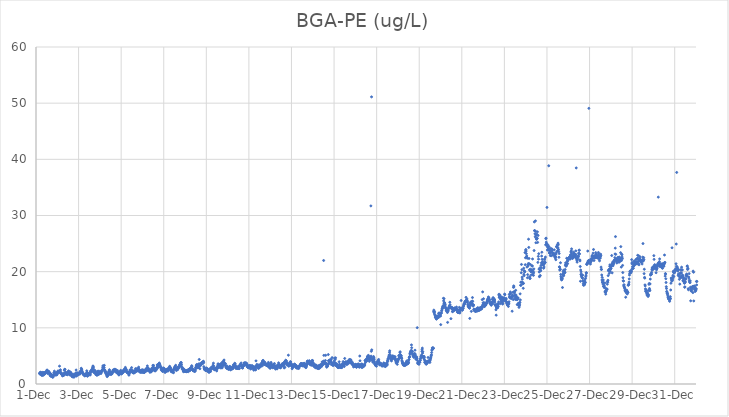
| Category | BGA-PE (ug/L) |
|---|---|
| 44896.166666666664 | 1.91 |
| 44896.177083333336 | 1.79 |
| 44896.1875 | 1.92 |
| 44896.197916666664 | 2.06 |
| 44896.208333333336 | 1.97 |
| 44896.21875 | 2.09 |
| 44896.229166666664 | 1.69 |
| 44896.239583333336 | 1.84 |
| 44896.25 | 1.74 |
| 44896.260416666664 | 1.87 |
| 44896.270833333336 | 1.54 |
| 44896.28125 | 1.59 |
| 44896.291666666664 | 2.07 |
| 44896.302083333336 | 1.87 |
| 44896.3125 | 1.9 |
| 44896.322916666664 | 1.53 |
| 44896.333333333336 | 1.99 |
| 44896.34375 | 1.92 |
| 44896.354166666664 | 1.89 |
| 44896.364583333336 | 1.63 |
| 44896.375 | 2.02 |
| 44896.385416666664 | 2.06 |
| 44896.395833333336 | 1.85 |
| 44896.40625 | 1.89 |
| 44896.416666666664 | 1.83 |
| 44896.427083333336 | 1.83 |
| 44896.4375 | 2.04 |
| 44896.447916666664 | 2 |
| 44896.458333333336 | 1.98 |
| 44896.46875 | 2.1 |
| 44896.479166666664 | 2.08 |
| 44896.489583333336 | 2.22 |
| 44896.5 | 2.39 |
| 44896.510416666664 | 2.26 |
| 44896.520833333336 | 2.5 |
| 44896.53125 | 2.18 |
| 44896.541666666664 | 1.95 |
| 44896.552083333336 | 2.34 |
| 44896.5625 | 2.11 |
| 44896.572916666664 | 1.85 |
| 44896.583333333336 | 2.09 |
| 44896.59375 | 2.21 |
| 44896.604166666664 | 2.23 |
| 44896.614583333336 | 2.01 |
| 44896.625 | 1.96 |
| 44896.635416666664 | 1.91 |
| 44896.645833333336 | 1.97 |
| 44896.65625 | 1.56 |
| 44896.666666666664 | 1.87 |
| 44896.677083333336 | 1.82 |
| 44896.6875 | 1.38 |
| 44896.697916666664 | 1.75 |
| 44896.708333333336 | 1.66 |
| 44896.71875 | 1.58 |
| 44896.729166666664 | 1.52 |
| 44896.739583333336 | 1.45 |
| 44896.75 | 1.34 |
| 44896.760416666664 | 1.57 |
| 44896.770833333336 | 1.37 |
| 44896.78125 | 1.2 |
| 44896.791666666664 | 1.3 |
| 44896.802083333336 | 1.24 |
| 44896.8125 | 1.51 |
| 44896.822916666664 | 1.54 |
| 44896.833333333336 | 1.98 |
| 44896.84375 | 1.53 |
| 44896.854166666664 | 1.72 |
| 44896.864583333336 | 2.29 |
| 44896.875 | 2.01 |
| 44896.885416666664 | 1.99 |
| 44896.895833333336 | 1.96 |
| 44896.90625 | 1.89 |
| 44896.916666666664 | 1.58 |
| 44896.927083333336 | 1.79 |
| 44896.9375 | 1.78 |
| 44896.947916666664 | 1.93 |
| 44896.958333333336 | 2.02 |
| 44896.96875 | 1.61 |
| 44896.979166666664 | 1.74 |
| 44896.989583333336 | 1.69 |
| 44897.0 | 2 |
| 44897.010416666664 | 2.08 |
| 44897.020833333336 | 2.07 |
| 44897.03125 | 2.32 |
| 44897.041666666664 | 2.19 |
| 44897.052083333336 | 2.27 |
| 44897.0625 | 2.18 |
| 44897.072916666664 | 2.05 |
| 44897.083333333336 | 2.07 |
| 44897.09375 | 2.26 |
| 44897.104166666664 | 3.18 |
| 44897.114583333336 | 2.32 |
| 44897.125 | 2.27 |
| 44897.135416666664 | 2.33 |
| 44897.145833333336 | 2.53 |
| 44897.15625 | 2.04 |
| 44897.166666666664 | 2 |
| 44897.177083333336 | 1.83 |
| 44897.1875 | 1.84 |
| 44897.197916666664 | 1.83 |
| 44897.208333333336 | 1.89 |
| 44897.21875 | 1.68 |
| 44897.229166666664 | 1.65 |
| 44897.239583333336 | 1.49 |
| 44897.25 | 1.48 |
| 44897.260416666664 | 1.47 |
| 44897.270833333336 | 1.55 |
| 44897.28125 | 1.59 |
| 44897.291666666664 | 1.69 |
| 44897.302083333336 | 1.57 |
| 44897.3125 | 1.56 |
| 44897.322916666664 | 1.98 |
| 44897.333333333336 | 2.44 |
| 44897.34375 | 2.61 |
| 44897.354166666664 | 1.88 |
| 44897.364583333336 | 2.6 |
| 44897.375 | 1.91 |
| 44897.385416666664 | 2.04 |
| 44897.395833333336 | 1.93 |
| 44897.40625 | 2.07 |
| 44897.416666666664 | 1.72 |
| 44897.427083333336 | 1.72 |
| 44897.4375 | 1.78 |
| 44897.447916666664 | 1.75 |
| 44897.458333333336 | 1.8 |
| 44897.46875 | 1.64 |
| 44897.479166666664 | 1.81 |
| 44897.489583333336 | 1.78 |
| 44897.5 | 2.11 |
| 44897.510416666664 | 2.04 |
| 44897.520833333336 | 2.22 |
| 44897.53125 | 2.34 |
| 44897.541666666664 | 2.2 |
| 44897.552083333336 | 1.91 |
| 44897.5625 | 2 |
| 44897.572916666664 | 1.66 |
| 44897.583333333336 | 1.66 |
| 44897.59375 | 2.1 |
| 44897.604166666664 | 1.68 |
| 44897.614583333336 | 2.14 |
| 44897.625 | 1.8 |
| 44897.635416666664 | 1.88 |
| 44897.645833333336 | 1.98 |
| 44897.65625 | 1.86 |
| 44897.666666666664 | 1.84 |
| 44897.677083333336 | 1.38 |
| 44897.6875 | 1.61 |
| 44897.697916666664 | 1.38 |
| 44897.708333333336 | 1.39 |
| 44897.71875 | 1.28 |
| 44897.729166666664 | 1.31 |
| 44897.739583333336 | 1.36 |
| 44897.75 | 1.36 |
| 44897.760416666664 | 1.51 |
| 44897.770833333336 | 1.73 |
| 44897.78125 | 1.2 |
| 44897.791666666664 | 1.46 |
| 44897.802083333336 | 1.64 |
| 44897.8125 | 1.63 |
| 44897.822916666664 | 1.62 |
| 44897.833333333336 | 1.43 |
| 44897.84375 | 1.54 |
| 44897.854166666664 | 1.79 |
| 44897.864583333336 | 1.95 |
| 44897.875 | 1.62 |
| 44897.885416666664 | 2.49 |
| 44897.895833333336 | 1.72 |
| 44897.90625 | 1.41 |
| 44897.916666666664 | 1.97 |
| 44897.927083333336 | 1.67 |
| 44897.9375 | 1.8 |
| 44897.947916666664 | 1.98 |
| 44897.958333333336 | 1.76 |
| 44897.96875 | 1.9 |
| 44897.979166666664 | 1.66 |
| 44897.989583333336 | 1.74 |
| 44898.0 | 1.67 |
| 44898.010416666664 | 1.87 |
| 44898.020833333336 | 1.87 |
| 44898.03125 | 1.83 |
| 44898.041666666664 | 1.86 |
| 44898.052083333336 | 2.07 |
| 44898.0625 | 2.11 |
| 44898.072916666664 | 1.8 |
| 44898.083333333336 | 2.27 |
| 44898.09375 | 2.03 |
| 44898.104166666664 | 1.99 |
| 44898.114583333336 | 2.24 |
| 44898.125 | 2.8 |
| 44898.135416666664 | 2.66 |
| 44898.145833333336 | 2.57 |
| 44898.15625 | 2.27 |
| 44898.166666666664 | 2.29 |
| 44898.177083333336 | 2.08 |
| 44898.1875 | 1.98 |
| 44898.197916666664 | 1.98 |
| 44898.208333333336 | 1.79 |
| 44898.21875 | 1.82 |
| 44898.229166666664 | 1.67 |
| 44898.239583333336 | 1.81 |
| 44898.25 | 1.6 |
| 44898.260416666664 | 1.61 |
| 44898.270833333336 | 1.64 |
| 44898.28125 | 1.59 |
| 44898.291666666664 | 1.43 |
| 44898.302083333336 | 1.58 |
| 44898.3125 | 1.7 |
| 44898.322916666664 | 1.53 |
| 44898.333333333336 | 1.73 |
| 44898.34375 | 1.52 |
| 44898.354166666664 | 1.76 |
| 44898.364583333336 | 1.88 |
| 44898.375 | 1.8 |
| 44898.385416666664 | 2.35 |
| 44898.395833333336 | 2.11 |
| 44898.40625 | 2.01 |
| 44898.416666666664 | 1.38 |
| 44898.427083333336 | 1.68 |
| 44898.4375 | 1.63 |
| 44898.447916666664 | 1.8 |
| 44898.458333333336 | 1.59 |
| 44898.46875 | 1.88 |
| 44898.479166666664 | 1.68 |
| 44898.489583333336 | 1.59 |
| 44898.5 | 1.7 |
| 44898.510416666664 | 1.72 |
| 44898.520833333336 | 1.7 |
| 44898.53125 | 1.8 |
| 44898.541666666664 | 1.91 |
| 44898.552083333336 | 1.62 |
| 44898.5625 | 2.25 |
| 44898.572916666664 | 2.27 |
| 44898.583333333336 | 2.29 |
| 44898.59375 | 2.39 |
| 44898.604166666664 | 2.39 |
| 44898.614583333336 | 2.16 |
| 44898.625 | 2.52 |
| 44898.635416666664 | 2.53 |
| 44898.645833333336 | 2.8 |
| 44898.65625 | 2.44 |
| 44898.666666666664 | 3 |
| 44898.677083333336 | 3.21 |
| 44898.6875 | 3.08 |
| 44898.697916666664 | 2.86 |
| 44898.708333333336 | 2.44 |
| 44898.71875 | 2.19 |
| 44898.729166666664 | 2.01 |
| 44898.739583333336 | 2.12 |
| 44898.75 | 2.44 |
| 44898.760416666664 | 2.17 |
| 44898.770833333336 | 2.05 |
| 44898.78125 | 2.09 |
| 44898.791666666664 | 2.33 |
| 44898.802083333336 | 1.7 |
| 44898.8125 | 1.95 |
| 44898.822916666664 | 1.81 |
| 44898.833333333336 | 1.77 |
| 44898.84375 | 1.98 |
| 44898.854166666664 | 1.56 |
| 44898.864583333336 | 1.77 |
| 44898.875 | 2.05 |
| 44898.885416666664 | 1.81 |
| 44898.895833333336 | 1.61 |
| 44898.90625 | 2.21 |
| 44898.916666666664 | 2.3 |
| 44898.927083333336 | 1.9 |
| 44898.9375 | 2.01 |
| 44898.947916666664 | 1.72 |
| 44898.958333333336 | 1.79 |
| 44898.96875 | 1.92 |
| 44898.979166666664 | 2.24 |
| 44898.989583333336 | 1.97 |
| 44899.0 | 1.93 |
| 44899.010416666664 | 2.04 |
| 44899.020833333336 | 2.1 |
| 44899.03125 | 2.03 |
| 44899.041666666664 | 2.06 |
| 44899.052083333336 | 1.86 |
| 44899.0625 | 2.03 |
| 44899.072916666664 | 2.2 |
| 44899.083333333336 | 2.32 |
| 44899.09375 | 2.44 |
| 44899.104166666664 | 2.34 |
| 44899.114583333336 | 2.45 |
| 44899.125 | 2.61 |
| 44899.135416666664 | 2.97 |
| 44899.145833333336 | 3.25 |
| 44899.15625 | 3.17 |
| 44899.166666666664 | 2.81 |
| 44899.177083333336 | 2.7 |
| 44899.1875 | 2.87 |
| 44899.197916666664 | 2.93 |
| 44899.208333333336 | 3.32 |
| 44899.21875 | 2.52 |
| 44899.229166666664 | 2.21 |
| 44899.239583333336 | 2.42 |
| 44899.25 | 2.14 |
| 44899.260416666664 | 2.11 |
| 44899.270833333336 | 2.03 |
| 44899.28125 | 1.85 |
| 44899.291666666664 | 2.15 |
| 44899.302083333336 | 1.76 |
| 44899.3125 | 1.92 |
| 44899.322916666664 | 1.48 |
| 44899.333333333336 | 1.71 |
| 44899.34375 | 1.31 |
| 44899.354166666664 | 1.51 |
| 44899.364583333336 | 1.72 |
| 44899.375 | 1.72 |
| 44899.385416666664 | 1.52 |
| 44899.395833333336 | 1.87 |
| 44899.40625 | 1.92 |
| 44899.416666666664 | 2.27 |
| 44899.427083333336 | 1.91 |
| 44899.4375 | 2.15 |
| 44899.447916666664 | 2.54 |
| 44899.458333333336 | 2.29 |
| 44899.46875 | 1.72 |
| 44899.479166666664 | 1.85 |
| 44899.489583333336 | 2.12 |
| 44899.5 | 1.97 |
| 44899.510416666664 | 1.88 |
| 44899.520833333336 | 1.68 |
| 44899.53125 | 1.96 |
| 44899.541666666664 | 1.93 |
| 44899.552083333336 | 1.85 |
| 44899.5625 | 1.8 |
| 44899.572916666664 | 1.84 |
| 44899.583333333336 | 2.07 |
| 44899.59375 | 2.1 |
| 44899.604166666664 | 2.27 |
| 44899.614583333336 | 2.42 |
| 44899.625 | 2.16 |
| 44899.635416666664 | 2.54 |
| 44899.645833333336 | 2.45 |
| 44899.65625 | 2.4 |
| 44899.666666666664 | 2.4 |
| 44899.677083333336 | 2.31 |
| 44899.6875 | 2.42 |
| 44899.697916666664 | 2.55 |
| 44899.708333333336 | 2.64 |
| 44899.71875 | 2.37 |
| 44899.729166666664 | 2.22 |
| 44899.739583333336 | 2.39 |
| 44899.75 | 2.44 |
| 44899.760416666664 | 2.53 |
| 44899.770833333336 | 2.11 |
| 44899.78125 | 2.29 |
| 44899.791666666664 | 2 |
| 44899.802083333336 | 2.02 |
| 44899.8125 | 2.19 |
| 44899.822916666664 | 2.09 |
| 44899.833333333336 | 2.39 |
| 44899.84375 | 2.07 |
| 44899.854166666664 | 2.02 |
| 44899.864583333336 | 1.91 |
| 44899.875 | 1.78 |
| 44899.885416666664 | 1.69 |
| 44899.895833333336 | 1.6 |
| 44899.90625 | 1.85 |
| 44899.916666666664 | 1.97 |
| 44899.927083333336 | 2.16 |
| 44899.9375 | 2.11 |
| 44899.947916666664 | 2.08 |
| 44899.958333333336 | 2.14 |
| 44899.96875 | 2.15 |
| 44899.979166666664 | 2.43 |
| 44899.989583333336 | 1.83 |
| 44900.0 | 2.17 |
| 44900.010416666664 | 1.78 |
| 44900.020833333336 | 1.87 |
| 44900.03125 | 2.04 |
| 44900.041666666664 | 1.95 |
| 44900.052083333336 | 1.96 |
| 44900.0625 | 2.12 |
| 44900.072916666664 | 2.21 |
| 44900.083333333336 | 2.06 |
| 44900.09375 | 2.37 |
| 44900.104166666664 | 2.12 |
| 44900.114583333336 | 2.29 |
| 44900.125 | 2.28 |
| 44900.135416666664 | 2.53 |
| 44900.145833333336 | 2.6 |
| 44900.15625 | 2.34 |
| 44900.166666666664 | 2.5 |
| 44900.177083333336 | 2.72 |
| 44900.1875 | 2.46 |
| 44900.197916666664 | 2.96 |
| 44900.208333333336 | 2.66 |
| 44900.21875 | 2.5 |
| 44900.229166666664 | 2.63 |
| 44900.239583333336 | 2.57 |
| 44900.25 | 2.21 |
| 44900.260416666664 | 2.1 |
| 44900.270833333336 | 2.18 |
| 44900.28125 | 2.04 |
| 44900.291666666664 | 2.18 |
| 44900.302083333336 | 2.08 |
| 44900.3125 | 2.01 |
| 44900.322916666664 | 1.98 |
| 44900.333333333336 | 1.89 |
| 44900.34375 | 2.03 |
| 44900.354166666664 | 1.79 |
| 44900.364583333336 | 1.57 |
| 44900.375 | 1.79 |
| 44900.385416666664 | 1.86 |
| 44900.395833333336 | 2.19 |
| 44900.40625 | 2.29 |
| 44900.416666666664 | 2.47 |
| 44900.427083333336 | 2.52 |
| 44900.4375 | 2.39 |
| 44900.447916666664 | 2.52 |
| 44900.458333333336 | 2.17 |
| 44900.46875 | 2.31 |
| 44900.479166666664 | 2.41 |
| 44900.489583333336 | 2.92 |
| 44900.5 | 2.21 |
| 44900.510416666664 | 2.19 |
| 44900.520833333336 | 2.12 |
| 44900.53125 | 2.43 |
| 44900.541666666664 | 2.22 |
| 44900.552083333336 | 2.02 |
| 44900.5625 | 2.02 |
| 44900.572916666664 | 2.12 |
| 44900.583333333336 | 1.94 |
| 44900.59375 | 2.05 |
| 44900.604166666664 | 2.22 |
| 44900.614583333336 | 2.06 |
| 44900.625 | 2.37 |
| 44900.635416666664 | 2.01 |
| 44900.645833333336 | 2.27 |
| 44900.65625 | 2.3 |
| 44900.666666666664 | 2.32 |
| 44900.677083333336 | 2.74 |
| 44900.6875 | 2.27 |
| 44900.697916666664 | 2.41 |
| 44900.708333333336 | 2.45 |
| 44900.71875 | 2.33 |
| 44900.729166666664 | 2.25 |
| 44900.739583333336 | 2.53 |
| 44900.75 | 2.75 |
| 44900.760416666664 | 2.48 |
| 44900.770833333336 | 2.66 |
| 44900.78125 | 2.59 |
| 44900.791666666664 | 2.36 |
| 44900.802083333336 | 2.49 |
| 44900.8125 | 2.5 |
| 44900.822916666664 | 3 |
| 44900.833333333336 | 2.63 |
| 44900.84375 | 2.57 |
| 44900.854166666664 | 2.47 |
| 44900.864583333336 | 2.15 |
| 44900.875 | 2.29 |
| 44900.885416666664 | 2.2 |
| 44900.895833333336 | 2.13 |
| 44900.90625 | 2.37 |
| 44900.916666666664 | 2.22 |
| 44900.927083333336 | 2.09 |
| 44900.9375 | 2.08 |
| 44900.947916666664 | 2.17 |
| 44900.958333333336 | 2.31 |
| 44900.96875 | 2.49 |
| 44900.979166666664 | 2.29 |
| 44900.989583333336 | 2.52 |
| 44901.0 | 2.31 |
| 44901.010416666664 | 2.06 |
| 44901.020833333336 | 2.44 |
| 44901.03125 | 2.5 |
| 44901.041666666664 | 2.12 |
| 44901.052083333336 | 2.19 |
| 44901.0625 | 2.19 |
| 44901.072916666664 | 2.04 |
| 44901.083333333336 | 2.11 |
| 44901.09375 | 2.13 |
| 44901.104166666664 | 2.1 |
| 44901.114583333336 | 2.29 |
| 44901.125 | 2.36 |
| 44901.135416666664 | 2.42 |
| 44901.145833333336 | 2.47 |
| 44901.15625 | 2.51 |
| 44901.166666666664 | 2.72 |
| 44901.177083333336 | 2.63 |
| 44901.1875 | 2.49 |
| 44901.197916666664 | 2.31 |
| 44901.208333333336 | 2.63 |
| 44901.21875 | 2.78 |
| 44901.229166666664 | 3.22 |
| 44901.239583333336 | 2.78 |
| 44901.25 | 2.85 |
| 44901.260416666664 | 2.87 |
| 44901.270833333336 | 2.44 |
| 44901.28125 | 2.58 |
| 44901.291666666664 | 2.43 |
| 44901.302083333336 | 2.63 |
| 44901.3125 | 2.47 |
| 44901.322916666664 | 2.34 |
| 44901.333333333336 | 2.45 |
| 44901.34375 | 2.41 |
| 44901.354166666664 | 2.07 |
| 44901.364583333336 | 2.55 |
| 44901.375 | 2.42 |
| 44901.385416666664 | 2.37 |
| 44901.395833333336 | 2.31 |
| 44901.40625 | 2.33 |
| 44901.416666666664 | 2.18 |
| 44901.427083333336 | 2.3 |
| 44901.4375 | 2.65 |
| 44901.447916666664 | 2.83 |
| 44901.458333333336 | 2.45 |
| 44901.46875 | 2.7 |
| 44901.479166666664 | 2.93 |
| 44901.489583333336 | 3.31 |
| 44901.5 | 2.6 |
| 44901.510416666664 | 3.03 |
| 44901.520833333336 | 3.31 |
| 44901.53125 | 2.6 |
| 44901.541666666664 | 2.87 |
| 44901.552083333336 | 2.42 |
| 44901.5625 | 2.65 |
| 44901.572916666664 | 2.37 |
| 44901.583333333336 | 2.7 |
| 44901.59375 | 2.56 |
| 44901.604166666664 | 2.34 |
| 44901.614583333336 | 2.49 |
| 44901.625 | 2.73 |
| 44901.635416666664 | 2.78 |
| 44901.645833333336 | 2.51 |
| 44901.65625 | 2.72 |
| 44901.666666666664 | 2.64 |
| 44901.677083333336 | 2.91 |
| 44901.6875 | 3.02 |
| 44901.697916666664 | 3.41 |
| 44901.708333333336 | 3.16 |
| 44901.71875 | 3.43 |
| 44901.729166666664 | 3.39 |
| 44901.739583333336 | 2.94 |
| 44901.75 | 3.37 |
| 44901.760416666664 | 3.37 |
| 44901.770833333336 | 3.61 |
| 44901.78125 | 3.47 |
| 44901.791666666664 | 3.74 |
| 44901.802083333336 | 3.49 |
| 44901.8125 | 3.53 |
| 44901.822916666664 | 3.35 |
| 44901.833333333336 | 3.07 |
| 44901.84375 | 3.02 |
| 44901.854166666664 | 3.12 |
| 44901.864583333336 | 2.87 |
| 44901.875 | 2.66 |
| 44901.885416666664 | 2.84 |
| 44901.895833333336 | 2.45 |
| 44901.90625 | 2.67 |
| 44901.916666666664 | 2.38 |
| 44901.927083333336 | 2.45 |
| 44901.9375 | 2.31 |
| 44901.947916666664 | 2.24 |
| 44901.958333333336 | 2.35 |
| 44901.96875 | 2.47 |
| 44901.979166666664 | 2.87 |
| 44901.989583333336 | 2.3 |
| 44902.0 | 2.58 |
| 44902.010416666664 | 2.62 |
| 44902.020833333336 | 2.77 |
| 44902.03125 | 2.35 |
| 44902.041666666664 | 2.34 |
| 44902.052083333336 | 2.26 |
| 44902.0625 | 2.05 |
| 44902.072916666664 | 2.43 |
| 44902.083333333336 | 2.55 |
| 44902.09375 | 2.33 |
| 44902.104166666664 | 2.27 |
| 44902.114583333336 | 2.54 |
| 44902.125 | 2.34 |
| 44902.135416666664 | 2.28 |
| 44902.145833333336 | 2.41 |
| 44902.15625 | 2.34 |
| 44902.166666666664 | 2.68 |
| 44902.177083333336 | 2.62 |
| 44902.1875 | 2.65 |
| 44902.197916666664 | 2.29 |
| 44902.208333333336 | 2.49 |
| 44902.21875 | 2.57 |
| 44902.229166666664 | 2.74 |
| 44902.239583333336 | 2.52 |
| 44902.25 | 2.76 |
| 44902.260416666664 | 2.88 |
| 44902.270833333336 | 3.04 |
| 44902.28125 | 3.15 |
| 44902.291666666664 | 2.91 |
| 44902.302083333336 | 2.77 |
| 44902.3125 | 2.57 |
| 44902.322916666664 | 2.89 |
| 44902.333333333336 | 2.6 |
| 44902.34375 | 2.44 |
| 44902.354166666664 | 2.19 |
| 44902.364583333336 | 2.35 |
| 44902.375 | 2.19 |
| 44902.385416666664 | 2.28 |
| 44902.395833333336 | 2.35 |
| 44902.40625 | 2.3 |
| 44902.416666666664 | 2.35 |
| 44902.427083333336 | 2.11 |
| 44902.4375 | 2.13 |
| 44902.447916666664 | 2.29 |
| 44902.458333333336 | 2.01 |
| 44902.46875 | 2.53 |
| 44902.479166666664 | 2.69 |
| 44902.489583333336 | 2.74 |
| 44902.5 | 2.85 |
| 44902.510416666664 | 2.71 |
| 44902.520833333336 | 3.11 |
| 44902.53125 | 2.96 |
| 44902.541666666664 | 2.79 |
| 44902.552083333336 | 2.98 |
| 44902.5625 | 3.33 |
| 44902.572916666664 | 2.64 |
| 44902.583333333336 | 2.64 |
| 44902.59375 | 2.4 |
| 44902.604166666664 | 2.57 |
| 44902.614583333336 | 2.88 |
| 44902.625 | 2.62 |
| 44902.635416666664 | 2.77 |
| 44902.645833333336 | 2.82 |
| 44902.65625 | 2.55 |
| 44902.666666666664 | 2.75 |
| 44902.677083333336 | 3 |
| 44902.6875 | 2.97 |
| 44902.697916666664 | 3.01 |
| 44902.708333333336 | 2.98 |
| 44902.71875 | 2.91 |
| 44902.729166666664 | 3.14 |
| 44902.739583333336 | 3.14 |
| 44902.75 | 3.47 |
| 44902.760416666664 | 3.47 |
| 44902.770833333336 | 3.35 |
| 44902.78125 | 3.56 |
| 44902.791666666664 | 3.75 |
| 44902.802083333336 | 3.36 |
| 44902.8125 | 3.84 |
| 44902.822916666664 | 3.76 |
| 44902.833333333336 | 3.46 |
| 44902.84375 | 3.09 |
| 44902.854166666664 | 2.88 |
| 44902.864583333336 | 2.67 |
| 44902.875 | 2.84 |
| 44902.885416666664 | 2.79 |
| 44902.895833333336 | 2.74 |
| 44902.90625 | 2.53 |
| 44902.916666666664 | 2.33 |
| 44902.927083333336 | 2.19 |
| 44902.9375 | 2.4 |
| 44902.947916666664 | 2.65 |
| 44902.958333333336 | 2.32 |
| 44902.96875 | 2.25 |
| 44902.979166666664 | 2.48 |
| 44902.989583333336 | 2.29 |
| 44903.0 | 2.33 |
| 44903.010416666664 | 2.31 |
| 44903.020833333336 | 2.24 |
| 44903.03125 | 2.24 |
| 44903.041666666664 | 2.36 |
| 44903.052083333336 | 2.39 |
| 44903.0625 | 2.22 |
| 44903.072916666664 | 2.2 |
| 44903.083333333336 | 2.22 |
| 44903.09375 | 2.26 |
| 44903.104166666664 | 2.39 |
| 44903.114583333336 | 2.46 |
| 44903.125 | 2.34 |
| 44903.135416666664 | 2.36 |
| 44903.145833333336 | 2.47 |
| 44903.15625 | 2.2 |
| 44903.166666666664 | 2.56 |
| 44903.177083333336 | 2.57 |
| 44903.1875 | 2.55 |
| 44903.197916666664 | 2.58 |
| 44903.208333333336 | 2.63 |
| 44903.21875 | 2.4 |
| 44903.229166666664 | 2.47 |
| 44903.239583333336 | 2.68 |
| 44903.25 | 2.46 |
| 44903.260416666664 | 2.87 |
| 44903.270833333336 | 2.92 |
| 44903.28125 | 2.73 |
| 44903.291666666664 | 2.71 |
| 44903.302083333336 | 2.75 |
| 44903.3125 | 3.26 |
| 44903.322916666664 | 3.13 |
| 44903.333333333336 | 2.82 |
| 44903.34375 | 2.64 |
| 44903.354166666664 | 2.5 |
| 44903.364583333336 | 2.47 |
| 44903.375 | 2.56 |
| 44903.385416666664 | 2.4 |
| 44903.395833333336 | 2.37 |
| 44903.40625 | 2.37 |
| 44903.416666666664 | 2.52 |
| 44903.427083333336 | 2.3 |
| 44903.4375 | 2.34 |
| 44903.447916666664 | 2.42 |
| 44903.458333333336 | 2.23 |
| 44903.46875 | 2.37 |
| 44903.479166666664 | 2.33 |
| 44903.489583333336 | 2.63 |
| 44903.5 | 2.9 |
| 44903.510416666664 | 2.94 |
| 44903.520833333336 | 3.04 |
| 44903.53125 | 3.33 |
| 44903.541666666664 | 3.24 |
| 44903.552083333336 | 3.48 |
| 44903.5625 | 3.15 |
| 44903.572916666664 | 3.39 |
| 44903.583333333336 | 2.92 |
| 44903.59375 | 2.93 |
| 44903.604166666664 | 3.01 |
| 44903.614583333336 | 2.92 |
| 44903.625 | 3.01 |
| 44903.635416666664 | 3.25 |
| 44903.645833333336 | 3.58 |
| 44903.65625 | 3.03 |
| 44903.666666666664 | 4.37 |
| 44903.677083333336 | 3.37 |
| 44903.6875 | 3.57 |
| 44903.697916666664 | 2.72 |
| 44903.708333333336 | 3.26 |
| 44903.71875 | 3.33 |
| 44903.729166666664 | 3.37 |
| 44903.739583333336 | 3.35 |
| 44903.75 | 3.47 |
| 44903.760416666664 | 3.53 |
| 44903.770833333336 | 3.77 |
| 44903.78125 | 3.76 |
| 44903.791666666664 | 3.76 |
| 44903.802083333336 | 3.67 |
| 44903.8125 | 3.78 |
| 44903.822916666664 | 3.87 |
| 44903.833333333336 | 3.82 |
| 44903.84375 | 3.67 |
| 44903.854166666664 | 3.99 |
| 44903.864583333336 | 4.04 |
| 44903.875 | 3.81 |
| 44903.885416666664 | 3.09 |
| 44903.895833333336 | 2.87 |
| 44903.90625 | 2.71 |
| 44903.916666666664 | 2.55 |
| 44903.927083333336 | 2.77 |
| 44903.9375 | 2.68 |
| 44903.947916666664 | 2.6 |
| 44903.958333333336 | 2.55 |
| 44903.96875 | 2.42 |
| 44903.979166666664 | 2.4 |
| 44903.989583333336 | 2.5 |
| 44904.0 | 2.79 |
| 44904.010416666664 | 2.84 |
| 44904.020833333336 | 2.58 |
| 44904.03125 | 2.49 |
| 44904.041666666664 | 2.33 |
| 44904.052083333336 | 2.69 |
| 44904.0625 | 2.25 |
| 44904.072916666664 | 2.65 |
| 44904.083333333336 | 2.53 |
| 44904.09375 | 2.39 |
| 44904.104166666664 | 2.38 |
| 44904.114583333336 | 2.52 |
| 44904.125 | 2.06 |
| 44904.135416666664 | 2.52 |
| 44904.145833333336 | 2.65 |
| 44904.15625 | 2.19 |
| 44904.166666666664 | 2.26 |
| 44904.177083333336 | 2.67 |
| 44904.1875 | 2.49 |
| 44904.197916666664 | 2.22 |
| 44904.208333333336 | 2.58 |
| 44904.21875 | 2.85 |
| 44904.229166666664 | 2.83 |
| 44904.239583333336 | 2.96 |
| 44904.25 | 2.65 |
| 44904.260416666664 | 2.83 |
| 44904.270833333336 | 2.88 |
| 44904.28125 | 3.01 |
| 44904.291666666664 | 2.89 |
| 44904.302083333336 | 3.04 |
| 44904.3125 | 3.35 |
| 44904.322916666664 | 3.15 |
| 44904.333333333336 | 3.71 |
| 44904.34375 | 3.22 |
| 44904.354166666664 | 2.71 |
| 44904.364583333336 | 2.77 |
| 44904.375 | 2.59 |
| 44904.385416666664 | 2.55 |
| 44904.395833333336 | 2.71 |
| 44904.40625 | 2.54 |
| 44904.416666666664 | 2.56 |
| 44904.427083333336 | 2.74 |
| 44904.4375 | 2.69 |
| 44904.447916666664 | 2.76 |
| 44904.458333333336 | 2.88 |
| 44904.46875 | 2.62 |
| 44904.479166666664 | 2.9 |
| 44904.489583333336 | 2.33 |
| 44904.5 | 2.71 |
| 44904.510416666664 | 2.71 |
| 44904.520833333336 | 3.01 |
| 44904.53125 | 3.19 |
| 44904.541666666664 | 3.37 |
| 44904.552083333336 | 3.6 |
| 44904.5625 | 3.48 |
| 44904.572916666664 | 2.99 |
| 44904.583333333336 | 3.28 |
| 44904.59375 | 2.93 |
| 44904.604166666664 | 3.48 |
| 44904.614583333336 | 3.33 |
| 44904.625 | 3.08 |
| 44904.635416666664 | 3.21 |
| 44904.645833333336 | 3.37 |
| 44904.65625 | 3.27 |
| 44904.666666666664 | 3.46 |
| 44904.677083333336 | 3.18 |
| 44904.6875 | 2.83 |
| 44904.697916666664 | 3.67 |
| 44904.708333333336 | 3.06 |
| 44904.71875 | 2.98 |
| 44904.729166666664 | 3.22 |
| 44904.739583333336 | 3.17 |
| 44904.75 | 2.9 |
| 44904.760416666664 | 3.92 |
| 44904.770833333336 | 3.33 |
| 44904.78125 | 3.48 |
| 44904.791666666664 | 3.47 |
| 44904.802083333336 | 3.31 |
| 44904.8125 | 4.1 |
| 44904.822916666664 | 3.53 |
| 44904.833333333336 | 4.27 |
| 44904.84375 | 3.84 |
| 44904.854166666664 | 3.53 |
| 44904.864583333336 | 3.58 |
| 44904.875 | 3.56 |
| 44904.885416666664 | 3.56 |
| 44904.895833333336 | 3.63 |
| 44904.90625 | 3.29 |
| 44904.916666666664 | 3.03 |
| 44904.927083333336 | 3.12 |
| 44904.9375 | 2.97 |
| 44904.947916666664 | 2.83 |
| 44904.958333333336 | 2.78 |
| 44904.96875 | 2.93 |
| 44904.979166666664 | 3.18 |
| 44904.989583333336 | 2.95 |
| 44905.0 | 3.02 |
| 44905.010416666664 | 2.82 |
| 44905.020833333336 | 2.88 |
| 44905.03125 | 2.63 |
| 44905.041666666664 | 2.66 |
| 44905.052083333336 | 2.77 |
| 44905.0625 | 2.65 |
| 44905.072916666664 | 2.68 |
| 44905.083333333336 | 2.9 |
| 44905.09375 | 3.1 |
| 44905.104166666664 | 3.13 |
| 44905.114583333336 | 2.86 |
| 44905.125 | 2.6 |
| 44905.135416666664 | 2.76 |
| 44905.145833333336 | 2.51 |
| 44905.15625 | 2.73 |
| 44905.166666666664 | 2.89 |
| 44905.177083333336 | 2.81 |
| 44905.1875 | 2.97 |
| 44905.197916666664 | 2.74 |
| 44905.208333333336 | 2.81 |
| 44905.21875 | 2.72 |
| 44905.229166666664 | 2.81 |
| 44905.239583333336 | 2.71 |
| 44905.25 | 2.92 |
| 44905.260416666664 | 3.02 |
| 44905.270833333336 | 3.4 |
| 44905.28125 | 3.23 |
| 44905.291666666664 | 2.99 |
| 44905.302083333336 | 3.36 |
| 44905.3125 | 3.48 |
| 44905.322916666664 | 3.3 |
| 44905.333333333336 | 3.69 |
| 44905.34375 | 3.51 |
| 44905.354166666664 | 3.59 |
| 44905.364583333336 | 3.17 |
| 44905.375 | 3.15 |
| 44905.385416666664 | 2.79 |
| 44905.395833333336 | 2.84 |
| 44905.40625 | 2.9 |
| 44905.416666666664 | 2.94 |
| 44905.427083333336 | 2.81 |
| 44905.4375 | 3.09 |
| 44905.447916666664 | 2.79 |
| 44905.458333333336 | 2.78 |
| 44905.46875 | 2.78 |
| 44905.479166666664 | 3.02 |
| 44905.489583333336 | 2.91 |
| 44905.5 | 3.03 |
| 44905.510416666664 | 2.93 |
| 44905.520833333336 | 2.78 |
| 44905.53125 | 2.74 |
| 44905.541666666664 | 3.14 |
| 44905.552083333336 | 2.75 |
| 44905.5625 | 3.26 |
| 44905.572916666664 | 3.15 |
| 44905.583333333336 | 3.37 |
| 44905.59375 | 3.47 |
| 44905.604166666664 | 3.5 |
| 44905.614583333336 | 3.27 |
| 44905.625 | 3.36 |
| 44905.635416666664 | 3.74 |
| 44905.645833333336 | 3.34 |
| 44905.65625 | 3.08 |
| 44905.666666666664 | 3.36 |
| 44905.677083333336 | 3.07 |
| 44905.6875 | 2.87 |
| 44905.697916666664 | 2.96 |
| 44905.708333333336 | 2.84 |
| 44905.71875 | 3.21 |
| 44905.729166666664 | 3.18 |
| 44905.739583333336 | 3.17 |
| 44905.75 | 3.24 |
| 44905.760416666664 | 3.41 |
| 44905.770833333336 | 3.74 |
| 44905.78125 | 3.69 |
| 44905.791666666664 | 3.68 |
| 44905.802083333336 | 3.75 |
| 44905.8125 | 3.37 |
| 44905.822916666664 | 3.7 |
| 44905.833333333336 | 3.58 |
| 44905.84375 | 3.48 |
| 44905.854166666664 | 3.8 |
| 44905.864583333336 | 3.5 |
| 44905.875 | 3.45 |
| 44905.885416666664 | 3.64 |
| 44905.895833333336 | 3.65 |
| 44905.90625 | 3.36 |
| 44905.916666666664 | 3.07 |
| 44905.927083333336 | 3.1 |
| 44905.9375 | 3.25 |
| 44905.947916666664 | 3.04 |
| 44905.958333333336 | 3 |
| 44905.96875 | 2.88 |
| 44905.979166666664 | 3.14 |
| 44905.989583333336 | 3.02 |
| 44906.0 | 3.3 |
| 44906.010416666664 | 3.13 |
| 44906.020833333336 | 3.02 |
| 44906.03125 | 2.9 |
| 44906.041666666664 | 3.05 |
| 44906.052083333336 | 3.3 |
| 44906.0625 | 3.14 |
| 44906.072916666664 | 2.94 |
| 44906.083333333336 | 2.66 |
| 44906.09375 | 3.23 |
| 44906.104166666664 | 3.18 |
| 44906.114583333336 | 2.99 |
| 44906.125 | 2.89 |
| 44906.135416666664 | 3.17 |
| 44906.145833333336 | 3.25 |
| 44906.15625 | 2.81 |
| 44906.166666666664 | 3.23 |
| 44906.177083333336 | 2.82 |
| 44906.1875 | 3.07 |
| 44906.197916666664 | 2.85 |
| 44906.208333333336 | 2.8 |
| 44906.21875 | 3.02 |
| 44906.229166666664 | 2.46 |
| 44906.239583333336 | 2.72 |
| 44906.25 | 3.03 |
| 44906.260416666664 | 2.79 |
| 44906.270833333336 | 2.78 |
| 44906.28125 | 2.88 |
| 44906.291666666664 | 3.06 |
| 44906.302083333336 | 2.51 |
| 44906.3125 | 2.83 |
| 44906.322916666664 | 2.56 |
| 44906.333333333336 | 4.12 |
| 44906.34375 | 3.18 |
| 44906.354166666664 | 3.28 |
| 44906.364583333336 | 3.11 |
| 44906.375 | 3.49 |
| 44906.385416666664 | 3.21 |
| 44906.395833333336 | 3.16 |
| 44906.40625 | 3.1 |
| 44906.416666666664 | 3.24 |
| 44906.427083333336 | 2.93 |
| 44906.4375 | 3.09 |
| 44906.447916666664 | 2.83 |
| 44906.458333333336 | 2.8 |
| 44906.46875 | 2.87 |
| 44906.479166666664 | 3.43 |
| 44906.489583333336 | 2.93 |
| 44906.5 | 3.12 |
| 44906.510416666664 | 3.03 |
| 44906.520833333336 | 3.2 |
| 44906.53125 | 3.22 |
| 44906.541666666664 | 3.23 |
| 44906.552083333336 | 3.3 |
| 44906.5625 | 3.31 |
| 44906.572916666664 | 3.39 |
| 44906.583333333336 | 3.67 |
| 44906.59375 | 3.33 |
| 44906.604166666664 | 3.17 |
| 44906.614583333336 | 3.51 |
| 44906.625 | 3.88 |
| 44906.635416666664 | 3.91 |
| 44906.645833333336 | 4.07 |
| 44906.65625 | 4.13 |
| 44906.666666666664 | 4.21 |
| 44906.677083333336 | 3.41 |
| 44906.6875 | 3.76 |
| 44906.697916666664 | 3.72 |
| 44906.708333333336 | 3.91 |
| 44906.71875 | 3.67 |
| 44906.729166666664 | 3.85 |
| 44906.739583333336 | 3.9 |
| 44906.75 | 3.59 |
| 44906.760416666664 | 3.46 |
| 44906.770833333336 | 3.45 |
| 44906.78125 | 3.4 |
| 44906.791666666664 | 3.45 |
| 44906.802083333336 | 3.55 |
| 44906.8125 | 3.49 |
| 44906.822916666664 | 3.57 |
| 44906.833333333336 | 3.4 |
| 44906.84375 | 3.3 |
| 44906.854166666664 | 3.26 |
| 44906.864583333336 | 3.47 |
| 44906.875 | 3.22 |
| 44906.885416666664 | 3.52 |
| 44906.895833333336 | 3.16 |
| 44906.90625 | 3.52 |
| 44906.916666666664 | 3.84 |
| 44906.927083333336 | 3.54 |
| 44906.9375 | 3.48 |
| 44906.947916666664 | 3.15 |
| 44906.958333333336 | 3.19 |
| 44906.96875 | 2.9 |
| 44906.979166666664 | 3.17 |
| 44906.989583333336 | 2.91 |
| 44907.0 | 2.79 |
| 44907.010416666664 | 3.09 |
| 44907.020833333336 | 2.91 |
| 44907.03125 | 3.6 |
| 44907.041666666664 | 3.84 |
| 44907.052083333336 | 3.51 |
| 44907.0625 | 3.21 |
| 44907.072916666664 | 3.27 |
| 44907.083333333336 | 3.43 |
| 44907.09375 | 3.25 |
| 44907.104166666664 | 3.07 |
| 44907.114583333336 | 3.05 |
| 44907.125 | 2.88 |
| 44907.135416666664 | 3.24 |
| 44907.145833333336 | 3.39 |
| 44907.15625 | 3.47 |
| 44907.166666666664 | 3.39 |
| 44907.177083333336 | 2.98 |
| 44907.1875 | 2.92 |
| 44907.197916666664 | 3.64 |
| 44907.208333333336 | 3.13 |
| 44907.21875 | 3.04 |
| 44907.229166666664 | 3.24 |
| 44907.239583333336 | 2.97 |
| 44907.25 | 2.65 |
| 44907.260416666664 | 3.06 |
| 44907.270833333336 | 3.16 |
| 44907.28125 | 3.08 |
| 44907.291666666664 | 2.85 |
| 44907.302083333336 | 3.04 |
| 44907.3125 | 3.01 |
| 44907.322916666664 | 2.69 |
| 44907.333333333336 | 3.32 |
| 44907.34375 | 2.86 |
| 44907.354166666664 | 3.23 |
| 44907.364583333336 | 3.14 |
| 44907.375 | 3.23 |
| 44907.385416666664 | 3.49 |
| 44907.395833333336 | 3.77 |
| 44907.40625 | 3.4 |
| 44907.416666666664 | 3.41 |
| 44907.427083333336 | 3.43 |
| 44907.4375 | 3.14 |
| 44907.447916666664 | 3.26 |
| 44907.458333333336 | 2.93 |
| 44907.46875 | 3.03 |
| 44907.479166666664 | 2.93 |
| 44907.489583333336 | 2.88 |
| 44907.5 | 3.06 |
| 44907.510416666664 | 3.27 |
| 44907.520833333336 | 3.28 |
| 44907.53125 | 3.34 |
| 44907.541666666664 | 3.32 |
| 44907.552083333336 | 3.57 |
| 44907.5625 | 3.35 |
| 44907.572916666664 | 3.21 |
| 44907.583333333336 | 3.37 |
| 44907.59375 | 3.61 |
| 44907.604166666664 | 3.64 |
| 44907.614583333336 | 3.29 |
| 44907.625 | 3.7 |
| 44907.635416666664 | 3.6 |
| 44907.645833333336 | 3.36 |
| 44907.65625 | 2.86 |
| 44907.666666666664 | 3.61 |
| 44907.677083333336 | 3.97 |
| 44907.6875 | 2.97 |
| 44907.697916666664 | 4.04 |
| 44907.708333333336 | 3.85 |
| 44907.71875 | 3.7 |
| 44907.729166666664 | 4.24 |
| 44907.739583333336 | 4.13 |
| 44907.75 | 4.11 |
| 44907.760416666664 | 4.06 |
| 44907.770833333336 | 3.82 |
| 44907.78125 | 3.41 |
| 44907.791666666664 | 3.66 |
| 44907.802083333336 | 3.66 |
| 44907.8125 | 3.66 |
| 44907.822916666664 | 3.36 |
| 44907.833333333336 | 3.41 |
| 44907.84375 | 3.5 |
| 44907.854166666664 | 5.13 |
| 44907.864583333336 | 3.49 |
| 44907.875 | 3.16 |
| 44907.885416666664 | 3.33 |
| 44907.895833333336 | 3.47 |
| 44907.90625 | 3.72 |
| 44907.916666666664 | 3.39 |
| 44907.927083333336 | 3.43 |
| 44907.9375 | 3.31 |
| 44907.947916666664 | 3.98 |
| 44907.958333333336 | 3.59 |
| 44907.96875 | 3.91 |
| 44907.979166666664 | 3.44 |
| 44907.989583333336 | 3.41 |
| 44908.0 | 3.27 |
| 44908.010416666664 | 3.54 |
| 44908.020833333336 | 3.26 |
| 44908.03125 | 2.72 |
| 44908.041666666664 | 3.01 |
| 44908.052083333336 | 3.02 |
| 44908.0625 | 2.94 |
| 44908.072916666664 | 3.22 |
| 44908.083333333336 | 3.28 |
| 44908.09375 | 3.33 |
| 44908.104166666664 | 3.21 |
| 44908.114583333336 | 3.21 |
| 44908.125 | 3.19 |
| 44908.135416666664 | 3.51 |
| 44908.145833333336 | 3.52 |
| 44908.15625 | 3.46 |
| 44908.166666666664 | 3.4 |
| 44908.177083333336 | 3.13 |
| 44908.1875 | 3.37 |
| 44908.197916666664 | 3.14 |
| 44908.208333333336 | 2.94 |
| 44908.21875 | 3.16 |
| 44908.229166666664 | 3.28 |
| 44908.239583333336 | 3.06 |
| 44908.25 | 2.83 |
| 44908.260416666664 | 2.97 |
| 44908.270833333336 | 2.82 |
| 44908.28125 | 2.94 |
| 44908.291666666664 | 3.04 |
| 44908.302083333336 | 2.86 |
| 44908.3125 | 2.98 |
| 44908.322916666664 | 2.83 |
| 44908.333333333336 | 2.96 |
| 44908.34375 | 2.77 |
| 44908.354166666664 | 3.17 |
| 44908.364583333336 | 3.24 |
| 44908.375 | 3.08 |
| 44908.385416666664 | 3.21 |
| 44908.395833333336 | 3.21 |
| 44908.40625 | 3.33 |
| 44908.416666666664 | 3.33 |
| 44908.427083333336 | 3.46 |
| 44908.4375 | 3.63 |
| 44908.447916666664 | 3.63 |
| 44908.458333333336 | 3.34 |
| 44908.46875 | 3.38 |
| 44908.479166666664 | 3.64 |
| 44908.489583333336 | 3.31 |
| 44908.5 | 3.58 |
| 44908.510416666664 | 3.3 |
| 44908.520833333336 | 3.23 |
| 44908.53125 | 3.38 |
| 44908.541666666664 | 3.43 |
| 44908.552083333336 | 3.66 |
| 44908.5625 | 3.49 |
| 44908.572916666664 | 3.35 |
| 44908.583333333336 | 3.19 |
| 44908.59375 | 3.59 |
| 44908.604166666664 | 3.61 |
| 44908.614583333336 | 3.67 |
| 44908.625 | 3.41 |
| 44908.635416666664 | 3.06 |
| 44908.645833333336 | 3.29 |
| 44908.65625 | 3.24 |
| 44908.666666666664 | 3.17 |
| 44908.677083333336 | 2.9 |
| 44908.6875 | 3.02 |
| 44908.697916666664 | 3.12 |
| 44908.708333333336 | 3.5 |
| 44908.71875 | 3.39 |
| 44908.729166666664 | 3.74 |
| 44908.739583333336 | 4.05 |
| 44908.75 | 3.53 |
| 44908.760416666664 | 4.06 |
| 44908.770833333336 | 4.07 |
| 44908.78125 | 3.97 |
| 44908.791666666664 | 3.94 |
| 44908.802083333336 | 3.92 |
| 44908.8125 | 3.93 |
| 44908.822916666664 | 3.84 |
| 44908.833333333336 | 4.13 |
| 44908.84375 | 4.07 |
| 44908.854166666664 | 3.73 |
| 44908.864583333336 | 3.56 |
| 44908.875 | 3.5 |
| 44908.885416666664 | 3.48 |
| 44908.895833333336 | 3.63 |
| 44908.90625 | 3.78 |
| 44908.916666666664 | 3.76 |
| 44908.927083333336 | 3.33 |
| 44908.9375 | 3.62 |
| 44908.947916666664 | 3.55 |
| 44908.958333333336 | 3.94 |
| 44908.96875 | 4.17 |
| 44908.979166666664 | 4.14 |
| 44908.989583333336 | 4.19 |
| 44909.0 | 3.62 |
| 44909.010416666664 | 3.82 |
| 44909.020833333336 | 3.29 |
| 44909.03125 | 3.34 |
| 44909.041666666664 | 3.27 |
| 44909.052083333336 | 3.22 |
| 44909.0625 | 3.55 |
| 44909.072916666664 | 3.15 |
| 44909.083333333336 | 3.31 |
| 44909.09375 | 2.99 |
| 44909.104166666664 | 3.36 |
| 44909.114583333336 | 3.34 |
| 44909.125 | 3.2 |
| 44909.135416666664 | 3.04 |
| 44909.145833333336 | 3.39 |
| 44909.15625 | 2.84 |
| 44909.166666666664 | 3.17 |
| 44909.177083333336 | 3.06 |
| 44909.1875 | 3.24 |
| 44909.197916666664 | 3.16 |
| 44909.208333333336 | 3.15 |
| 44909.21875 | 2.82 |
| 44909.229166666664 | 2.99 |
| 44909.239583333336 | 2.98 |
| 44909.25 | 2.74 |
| 44909.260416666664 | 2.88 |
| 44909.270833333336 | 3.08 |
| 44909.28125 | 3.01 |
| 44909.291666666664 | 2.77 |
| 44909.302083333336 | 3.33 |
| 44909.3125 | 2.9 |
| 44909.322916666664 | 3.09 |
| 44909.333333333336 | 2.87 |
| 44909.34375 | 3.35 |
| 44909.354166666664 | 3.13 |
| 44909.364583333336 | 3.38 |
| 44909.375 | 3.35 |
| 44909.385416666664 | 3.46 |
| 44909.395833333336 | 3.36 |
| 44909.40625 | 3.1 |
| 44909.416666666664 | 3.39 |
| 44909.427083333336 | 3.22 |
| 44909.4375 | 3.92 |
| 44909.447916666664 | 3.59 |
| 44909.458333333336 | 3.49 |
| 44909.46875 | 3.41 |
| 44909.479166666664 | 3.51 |
| 44909.489583333336 | 3.92 |
| 44909.5 | 4.07 |
| 44909.510416666664 | 21.99 |
| 44909.520833333336 | 5.1 |
| 44909.53125 | 3.78 |
| 44909.541666666664 | 4.03 |
| 44909.552083333336 | 3.74 |
| 44909.5625 | 3.61 |
| 44909.572916666664 | 3.63 |
| 44909.583333333336 | 3.63 |
| 44909.59375 | 4.18 |
| 44909.604166666664 | 5.11 |
| 44909.614583333336 | 3.68 |
| 44909.625 | 3.6 |
| 44909.635416666664 | 3.62 |
| 44909.645833333336 | 3.18 |
| 44909.65625 | 2.99 |
| 44909.666666666664 | 3.26 |
| 44909.677083333336 | 3.12 |
| 44909.6875 | 3.2 |
| 44909.697916666664 | 3.23 |
| 44909.708333333336 | 3.4 |
| 44909.71875 | 3.57 |
| 44909.729166666664 | 5.24 |
| 44909.739583333336 | 4.12 |
| 44909.75 | 4.18 |
| 44909.760416666664 | 3.64 |
| 44909.770833333336 | 3.84 |
| 44909.78125 | 3.81 |
| 44909.791666666664 | 3.93 |
| 44909.802083333336 | 3.96 |
| 44909.8125 | 4.33 |
| 44909.822916666664 | 4.27 |
| 44909.833333333336 | 4.18 |
| 44909.84375 | 3.98 |
| 44909.854166666664 | 3.93 |
| 44909.864583333336 | 4.36 |
| 44909.875 | 3.46 |
| 44909.885416666664 | 3.76 |
| 44909.895833333336 | 3.54 |
| 44909.90625 | 4.7 |
| 44909.916666666664 | 3.72 |
| 44909.927083333336 | 3.58 |
| 44909.9375 | 3.4 |
| 44909.947916666664 | 3.43 |
| 44909.958333333336 | 3.28 |
| 44909.96875 | 3.57 |
| 44909.979166666664 | 3.56 |
| 44909.989583333336 | 3.6 |
| 44910.0 | 4.08 |
| 44910.010416666664 | 3.82 |
| 44910.020833333336 | 4.6 |
| 44910.03125 | 3.42 |
| 44910.041666666664 | 3.7 |
| 44910.052083333336 | 4.35 |
| 44910.0625 | 3.76 |
| 44910.072916666664 | 4.66 |
| 44910.083333333336 | 3.37 |
| 44910.09375 | 3.29 |
| 44910.104166666664 | 3.55 |
| 44910.114583333336 | 3.24 |
| 44910.125 | 3.36 |
| 44910.135416666664 | 3.56 |
| 44910.145833333336 | 3.11 |
| 44910.15625 | 3.18 |
| 44910.166666666664 | 3.06 |
| 44910.177083333336 | 3.19 |
| 44910.1875 | 2.9 |
| 44910.197916666664 | 3.03 |
| 44910.208333333336 | 3.05 |
| 44910.21875 | 2.99 |
| 44910.229166666664 | 2.91 |
| 44910.239583333336 | 3.96 |
| 44910.25 | 3.45 |
| 44910.260416666664 | 3.48 |
| 44910.270833333336 | 3.05 |
| 44910.28125 | 3.03 |
| 44910.291666666664 | 3.15 |
| 44910.302083333336 | 3.06 |
| 44910.3125 | 2.96 |
| 44910.322916666664 | 2.94 |
| 44910.333333333336 | 3.19 |
| 44910.34375 | 2.94 |
| 44910.354166666664 | 3.11 |
| 44910.364583333336 | 2.92 |
| 44910.375 | 3.39 |
| 44910.385416666664 | 3.25 |
| 44910.395833333336 | 3.64 |
| 44910.40625 | 3.19 |
| 44910.416666666664 | 3.57 |
| 44910.427083333336 | 3.99 |
| 44910.4375 | 3.48 |
| 44910.447916666664 | 3.34 |
| 44910.458333333336 | 3.51 |
| 44910.46875 | 3.43 |
| 44910.479166666664 | 3.11 |
| 44910.489583333336 | 3.46 |
| 44910.5 | 4.55 |
| 44910.510416666664 | 3.78 |
| 44910.520833333336 | 3.84 |
| 44910.53125 | 3.67 |
| 44910.541666666664 | 3.95 |
| 44910.552083333336 | 3.75 |
| 44910.5625 | 3.9 |
| 44910.572916666664 | 3.7 |
| 44910.583333333336 | 3.45 |
| 44910.59375 | 3.93 |
| 44910.604166666664 | 3.76 |
| 44910.614583333336 | 3.62 |
| 44910.625 | 3.75 |
| 44910.635416666664 | 3.53 |
| 44910.645833333336 | 3.87 |
| 44910.65625 | 4.09 |
| 44910.666666666664 | 3.82 |
| 44910.677083333336 | 3.94 |
| 44910.6875 | 4.11 |
| 44910.697916666664 | 3.74 |
| 44910.708333333336 | 3.92 |
| 44910.71875 | 4.36 |
| 44910.729166666664 | 4.26 |
| 44910.739583333336 | 4.24 |
| 44910.75 | 4.24 |
| 44910.760416666664 | 4.23 |
| 44910.770833333336 | 4.12 |
| 44910.78125 | 4.33 |
| 44910.791666666664 | 4.15 |
| 44910.802083333336 | 3.77 |
| 44910.8125 | 3.73 |
| 44910.822916666664 | 3.7 |
| 44910.833333333336 | 3.73 |
| 44910.84375 | 3.51 |
| 44910.854166666664 | 3.88 |
| 44910.864583333336 | 3.55 |
| 44910.875 | 3.67 |
| 44910.885416666664 | 3.46 |
| 44910.895833333336 | 3.35 |
| 44910.90625 | 3.33 |
| 44910.916666666664 | 3.04 |
| 44910.927083333336 | 3.27 |
| 44910.9375 | 3.34 |
| 44910.947916666664 | 3.15 |
| 44910.958333333336 | 3.44 |
| 44910.96875 | 3.33 |
| 44910.979166666664 | 3.16 |
| 44910.989583333336 | 3.28 |
| 44911.0 | 3.43 |
| 44911.010416666664 | 3.42 |
| 44911.020833333336 | 3.51 |
| 44911.03125 | 3.1 |
| 44911.041666666664 | 3.03 |
| 44911.052083333336 | 3 |
| 44911.0625 | 3.03 |
| 44911.072916666664 | 3.22 |
| 44911.083333333336 | 3.42 |
| 44911.09375 | 3.42 |
| 44911.104166666664 | 3.36 |
| 44911.114583333336 | 3.36 |
| 44911.125 | 3.56 |
| 44911.135416666664 | 3.13 |
| 44911.145833333336 | 3.55 |
| 44911.15625 | 3.35 |
| 44911.166666666664 | 3.24 |
| 44911.177083333336 | 3.42 |
| 44911.1875 | 2.98 |
| 44911.197916666664 | 3.38 |
| 44911.208333333336 | 4.98 |
| 44911.21875 | 4.13 |
| 44911.229166666664 | 3.21 |
| 44911.239583333336 | 3.13 |
| 44911.25 | 3.09 |
| 44911.260416666664 | 3.42 |
| 44911.270833333336 | 3.44 |
| 44911.28125 | 3.15 |
| 44911.291666666664 | 3.56 |
| 44911.302083333336 | 3.4 |
| 44911.3125 | 2.91 |
| 44911.322916666664 | 3.51 |
| 44911.333333333336 | 3.12 |
| 44911.34375 | 3.33 |
| 44911.354166666664 | 3.34 |
| 44911.364583333336 | 3.21 |
| 44911.375 | 3.09 |
| 44911.385416666664 | 3.31 |
| 44911.395833333336 | 3.24 |
| 44911.40625 | 3.18 |
| 44911.416666666664 | 3.28 |
| 44911.427083333336 | 3.48 |
| 44911.4375 | 3.35 |
| 44911.447916666664 | 3.57 |
| 44911.458333333336 | 4.16 |
| 44911.46875 | 4.18 |
| 44911.479166666664 | 3.87 |
| 44911.489583333336 | 4.15 |
| 44911.5 | 4.36 |
| 44911.510416666664 | 4.34 |
| 44911.520833333336 | 4.34 |
| 44911.53125 | 4.09 |
| 44911.541666666664 | 4.2 |
| 44911.552083333336 | 4.6 |
| 44911.5625 | 4.81 |
| 44911.572916666664 | 4.93 |
| 44911.583333333336 | 4.52 |
| 44911.59375 | 4.83 |
| 44911.604166666664 | 4.98 |
| 44911.614583333336 | 5.09 |
| 44911.625 | 4.46 |
| 44911.635416666664 | 4.7 |
| 44911.645833333336 | 4.36 |
| 44911.65625 | 4.03 |
| 44911.666666666664 | 4.6 |
| 44911.677083333336 | 4.65 |
| 44911.6875 | 4.49 |
| 44911.697916666664 | 4.31 |
| 44911.708333333336 | 4.74 |
| 44911.71875 | 4.75 |
| 44911.729166666664 | 31.71 |
| 44911.739583333336 | 4.96 |
| 44911.75 | 5.82 |
| 44911.760416666664 | 51.12 |
| 44911.770833333336 | 6.08 |
| 44911.78125 | 4.6 |
| 44911.791666666664 | 4.21 |
| 44911.802083333336 | 4.36 |
| 44911.8125 | 4.11 |
| 44911.822916666664 | 3.87 |
| 44911.833333333336 | 4.42 |
| 44911.84375 | 4.4 |
| 44911.854166666664 | 4.89 |
| 44911.864583333336 | 4.55 |
| 44911.875 | 4.66 |
| 44911.885416666664 | 4.31 |
| 44911.895833333336 | 3.97 |
| 44911.90625 | 3.63 |
| 44911.916666666664 | 3.56 |
| 44911.927083333336 | 3.54 |
| 44911.9375 | 3.49 |
| 44911.947916666664 | 3.31 |
| 44911.958333333336 | 3.31 |
| 44911.96875 | 3.58 |
| 44911.979166666664 | 3.48 |
| 44911.989583333336 | 3.16 |
| 44912.0 | 3.52 |
| 44912.010416666664 | 3.87 |
| 44912.020833333336 | 3.7 |
| 44912.03125 | 3.83 |
| 44912.041666666664 | 3.83 |
| 44912.052083333336 | 3.97 |
| 44912.0625 | 4.18 |
| 44912.072916666664 | 3.98 |
| 44912.083333333336 | 4.13 |
| 44912.09375 | 4.37 |
| 44912.104166666664 | 3.99 |
| 44912.114583333336 | 3.77 |
| 44912.125 | 3.73 |
| 44912.135416666664 | 3.41 |
| 44912.145833333336 | 3.49 |
| 44912.15625 | 3.58 |
| 44912.166666666664 | 3.57 |
| 44912.177083333336 | 3.52 |
| 44912.1875 | 3.44 |
| 44912.197916666664 | 3.7 |
| 44912.208333333336 | 3.42 |
| 44912.21875 | 3.48 |
| 44912.229166666664 | 3.47 |
| 44912.239583333336 | 3.43 |
| 44912.25 | 3.19 |
| 44912.260416666664 | 3.36 |
| 44912.270833333336 | 3.22 |
| 44912.28125 | 3.34 |
| 44912.291666666664 | 3.44 |
| 44912.302083333336 | 3.41 |
| 44912.3125 | 3.24 |
| 44912.322916666664 | 3.28 |
| 44912.333333333336 | 3.76 |
| 44912.34375 | 3.33 |
| 44912.354166666664 | 3.56 |
| 44912.364583333336 | 3.58 |
| 44912.375 | 3.65 |
| 44912.385416666664 | 3.3 |
| 44912.395833333336 | 3.16 |
| 44912.40625 | 3.1 |
| 44912.416666666664 | 3.48 |
| 44912.427083333336 | 3.52 |
| 44912.4375 | 3.19 |
| 44912.447916666664 | 3.45 |
| 44912.458333333336 | 3.59 |
| 44912.46875 | 3.72 |
| 44912.479166666664 | 3.51 |
| 44912.489583333336 | 3.69 |
| 44912.5 | 3.4 |
| 44912.510416666664 | 4.14 |
| 44912.520833333336 | 4.01 |
| 44912.53125 | 4.37 |
| 44912.541666666664 | 4.55 |
| 44912.552083333336 | 4.52 |
| 44912.5625 | 4.55 |
| 44912.572916666664 | 4.9 |
| 44912.583333333336 | 5.02 |
| 44912.59375 | 5.2 |
| 44912.604166666664 | 5.64 |
| 44912.614583333336 | 5.91 |
| 44912.625 | 5.24 |
| 44912.635416666664 | 5.11 |
| 44912.645833333336 | 4.78 |
| 44912.65625 | 4.95 |
| 44912.666666666664 | 4.65 |
| 44912.677083333336 | 4.26 |
| 44912.6875 | 4.43 |
| 44912.697916666664 | 4.11 |
| 44912.708333333336 | 4.59 |
| 44912.71875 | 4.5 |
| 44912.729166666664 | 4.74 |
| 44912.739583333336 | 4.62 |
| 44912.75 | 4.61 |
| 44912.760416666664 | 5.02 |
| 44912.770833333336 | 4.77 |
| 44912.78125 | 4.64 |
| 44912.791666666664 | 4.65 |
| 44912.802083333336 | 4.63 |
| 44912.8125 | 4.86 |
| 44912.822916666664 | 4.82 |
| 44912.833333333336 | 4.6 |
| 44912.84375 | 4.48 |
| 44912.854166666664 | 4.79 |
| 44912.864583333336 | 4.86 |
| 44912.875 | 4.55 |
| 44912.885416666664 | 4.23 |
| 44912.895833333336 | 4.38 |
| 44912.90625 | 3.97 |
| 44912.916666666664 | 3.74 |
| 44912.927083333336 | 3.85 |
| 44912.9375 | 3.88 |
| 44912.947916666664 | 3.8 |
| 44912.958333333336 | 4.08 |
| 44912.96875 | 3.5 |
| 44912.979166666664 | 3.93 |
| 44912.989583333336 | 4.1 |
| 44913.0 | 4.11 |
| 44913.010416666664 | 4.4 |
| 44913.020833333336 | 4.48 |
| 44913.03125 | 4.36 |
| 44913.041666666664 | 5.01 |
| 44913.052083333336 | 5.09 |
| 44913.0625 | 4.8 |
| 44913.072916666664 | 4.75 |
| 44913.083333333336 | 4.84 |
| 44913.09375 | 5.59 |
| 44913.104166666664 | 5.73 |
| 44913.114583333336 | 5.22 |
| 44913.125 | 4.68 |
| 44913.135416666664 | 5.01 |
| 44913.145833333336 | 4.85 |
| 44913.15625 | 5.04 |
| 44913.166666666664 | 4.63 |
| 44913.177083333336 | 4.58 |
| 44913.1875 | 4.19 |
| 44913.197916666664 | 4.02 |
| 44913.208333333336 | 3.77 |
| 44913.21875 | 3.62 |
| 44913.229166666664 | 3.83 |
| 44913.239583333336 | 3.62 |
| 44913.25 | 3.46 |
| 44913.260416666664 | 3.33 |
| 44913.270833333336 | 3.42 |
| 44913.28125 | 3.5 |
| 44913.291666666664 | 3.37 |
| 44913.302083333336 | 3.35 |
| 44913.3125 | 3.57 |
| 44913.322916666664 | 3.28 |
| 44913.333333333336 | 3.48 |
| 44913.34375 | 3.52 |
| 44913.354166666664 | 3.39 |
| 44913.364583333336 | 3.67 |
| 44913.375 | 3.4 |
| 44913.385416666664 | 3.79 |
| 44913.395833333336 | 3.92 |
| 44913.40625 | 3.53 |
| 44913.416666666664 | 4.11 |
| 44913.427083333336 | 3.53 |
| 44913.4375 | 3.64 |
| 44913.447916666664 | 3.68 |
| 44913.458333333336 | 3.64 |
| 44913.46875 | 3.88 |
| 44913.479166666664 | 3.66 |
| 44913.489583333336 | 3.76 |
| 44913.5 | 3.89 |
| 44913.510416666664 | 4.31 |
| 44913.520833333336 | 4.37 |
| 44913.53125 | 4.73 |
| 44913.541666666664 | 4.79 |
| 44913.552083333336 | 4.9 |
| 44913.5625 | 5.35 |
| 44913.572916666664 | 5.4 |
| 44913.583333333336 | 5.61 |
| 44913.59375 | 5.78 |
| 44913.604166666664 | 5.55 |
| 44913.614583333336 | 5.87 |
| 44913.625 | 5.98 |
| 44913.635416666664 | 6.96 |
| 44913.645833333336 | 6.46 |
| 44913.65625 | 5.89 |
| 44913.666666666664 | 5.75 |
| 44913.677083333336 | 5.76 |
| 44913.6875 | 5.3 |
| 44913.697916666664 | 5.33 |
| 44913.708333333336 | 5.03 |
| 44913.71875 | 5.02 |
| 44913.729166666664 | 5.3 |
| 44913.739583333336 | 4.81 |
| 44913.75 | 4.75 |
| 44913.760416666664 | 5.12 |
| 44913.770833333336 | 4.84 |
| 44913.78125 | 5.42 |
| 44913.791666666664 | 5.27 |
| 44913.802083333336 | 6.02 |
| 44913.8125 | 5.32 |
| 44913.822916666664 | 5.01 |
| 44913.833333333336 | 4.71 |
| 44913.84375 | 4.42 |
| 44913.854166666664 | 4.61 |
| 44913.864583333336 | 4.41 |
| 44913.875 | 4.55 |
| 44913.885416666664 | 4.81 |
| 44913.895833333336 | 4.54 |
| 44913.90625 | 10.03 |
| 44913.916666666664 | 4.17 |
| 44913.927083333336 | 3.65 |
| 44913.9375 | 3.81 |
| 44913.947916666664 | 3.82 |
| 44913.958333333336 | 3.62 |
| 44913.96875 | 3.75 |
| 44913.979166666664 | 3.75 |
| 44913.989583333336 | 3.5 |
| 44914.0 | 3.87 |
| 44914.010416666664 | 3.84 |
| 44914.020833333336 | 3.9 |
| 44914.03125 | 3.88 |
| 44914.041666666664 | 4.26 |
| 44914.052083333336 | 4.22 |
| 44914.0625 | 4.54 |
| 44914.072916666664 | 4.61 |
| 44914.083333333336 | 4.92 |
| 44914.09375 | 4.89 |
| 44914.104166666664 | 5.11 |
| 44914.114583333336 | 5.1 |
| 44914.125 | 5.81 |
| 44914.135416666664 | 6.11 |
| 44914.145833333336 | 6.39 |
| 44914.15625 | 5.49 |
| 44914.166666666664 | 5.76 |
| 44914.177083333336 | 4.86 |
| 44914.1875 | 4.87 |
| 44914.197916666664 | 4.82 |
| 44914.208333333336 | 4.67 |
| 44914.21875 | 4.5 |
| 44914.229166666664 | 4.92 |
| 44914.239583333336 | 4.74 |
| 44914.25 | 4.28 |
| 44914.260416666664 | 3.84 |
| 44914.270833333336 | 3.92 |
| 44914.28125 | 4.08 |
| 44914.291666666664 | 3.85 |
| 44914.302083333336 | 3.75 |
| 44914.3125 | 3.87 |
| 44914.322916666664 | 3.53 |
| 44914.333333333336 | 3.6 |
| 44914.34375 | 3.6 |
| 44914.354166666664 | 3.8 |
| 44914.364583333336 | 4.02 |
| 44914.375 | 3.97 |
| 44914.385416666664 | 3.8 |
| 44914.395833333336 | 4.05 |
| 44914.40625 | 3.95 |
| 44914.416666666664 | 4.72 |
| 44914.427083333336 | 3.89 |
| 44914.4375 | 4.05 |
| 44914.447916666664 | 3.99 |
| 44914.458333333336 | 4.16 |
| 44914.46875 | 4.11 |
| 44914.479166666664 | 4.13 |
| 44914.489583333336 | 4.05 |
| 44914.5 | 3.84 |
| 44914.510416666664 | 4.2 |
| 44914.520833333336 | 4.35 |
| 44914.53125 | 4.57 |
| 44914.541666666664 | 4.68 |
| 44914.552083333336 | 4.94 |
| 44914.5625 | 5.12 |
| 44914.572916666664 | 5.19 |
| 44914.583333333336 | 5.6 |
| 44914.59375 | 6 |
| 44914.604166666664 | 6.15 |
| 44914.614583333336 | 6.43 |
| 44914.625 | 6.26 |
| 44914.635416666664 | 6.34 |
| 44914.645833333336 | 6.46 |
| 44914.65625 | 6.31 |
| 44914.666666666664 | 6.36 |
| 44914.677083333336 | 12.94 |
| 44914.6875 | 13.16 |
| 44914.697916666664 | 12.69 |
| 44914.708333333336 | 12.71 |
| 44914.71875 | 12.91 |
| 44914.729166666664 | 12.37 |
| 44914.739583333336 | 12.29 |
| 44914.75 | 12.12 |
| 44914.760416666664 | 11.87 |
| 44914.770833333336 | 11.8 |
| 44914.78125 | 11.92 |
| 44914.791666666664 | 11.79 |
| 44914.802083333336 | 11.59 |
| 44914.8125 | 11.57 |
| 44914.822916666664 | 12 |
| 44914.833333333336 | 12.06 |
| 44914.84375 | 11.8 |
| 44914.854166666664 | 12.05 |
| 44914.864583333336 | 12.11 |
| 44914.875 | 11.85 |
| 44914.885416666664 | 11.98 |
| 44914.895833333336 | 12.07 |
| 44914.90625 | 11.84 |
| 44914.916666666664 | 12.61 |
| 44914.927083333336 | 12.55 |
| 44914.9375 | 12.09 |
| 44914.947916666664 | 12.55 |
| 44914.958333333336 | 12.63 |
| 44914.96875 | 12.2 |
| 44914.979166666664 | 12.39 |
| 44914.989583333336 | 12.27 |
| 44915.0 | 12.08 |
| 44915.010416666664 | 10.57 |
| 44915.020833333336 | 12.6 |
| 44915.03125 | 12.64 |
| 44915.041666666664 | 12.65 |
| 44915.052083333336 | 13.01 |
| 44915.0625 | 13.14 |
| 44915.072916666664 | 13.37 |
| 44915.083333333336 | 13.51 |
| 44915.09375 | 13.45 |
| 44915.104166666664 | 13.74 |
| 44915.114583333336 | 13.78 |
| 44915.125 | 13.94 |
| 44915.135416666664 | 15.26 |
| 44915.145833333336 | 14.8 |
| 44915.15625 | 14.26 |
| 44915.166666666664 | 15.19 |
| 44915.177083333336 | 14.46 |
| 44915.1875 | 14.49 |
| 44915.197916666664 | 14.36 |
| 44915.208333333336 | 13.95 |
| 44915.21875 | 14.14 |
| 44915.229166666664 | 13.7 |
| 44915.239583333336 | 13.58 |
| 44915.25 | 13.44 |
| 44915.260416666664 | 13.47 |
| 44915.270833333336 | 13.11 |
| 44915.28125 | 13.23 |
| 44915.291666666664 | 12.98 |
| 44915.302083333336 | 12.94 |
| 44915.3125 | 13.02 |
| 44915.322916666664 | 12.73 |
| 44915.333333333336 | 10.97 |
| 44915.34375 | 13.24 |
| 44915.354166666664 | 12.96 |
| 44915.364583333336 | 13.15 |
| 44915.375 | 13.43 |
| 44915.385416666664 | 13.6 |
| 44915.395833333336 | 13.56 |
| 44915.40625 | 13.81 |
| 44915.416666666664 | 13.89 |
| 44915.427083333336 | 13.76 |
| 44915.4375 | 14.55 |
| 44915.447916666664 | 14.11 |
| 44915.458333333336 | 13.61 |
| 44915.46875 | 13.66 |
| 44915.479166666664 | 13.61 |
| 44915.489583333336 | 11.63 |
| 44915.5 | 13.69 |
| 44915.510416666664 | 13.48 |
| 44915.520833333336 | 13.46 |
| 44915.53125 | 13.41 |
| 44915.541666666664 | 13.64 |
| 44915.552083333336 | 13.4 |
| 44915.5625 | 12.88 |
| 44915.572916666664 | 12.92 |
| 44915.583333333336 | 13 |
| 44915.59375 | 13.16 |
| 44915.604166666664 | 13.31 |
| 44915.614583333336 | 13.34 |
| 44915.625 | 13.4 |
| 44915.635416666664 | 13.45 |
| 44915.645833333336 | 13.08 |
| 44915.65625 | 13.47 |
| 44915.666666666664 | 13.54 |
| 44915.677083333336 | 13.35 |
| 44915.6875 | 13.45 |
| 44915.697916666664 | 13.3 |
| 44915.708333333336 | 13.45 |
| 44915.71875 | 13.23 |
| 44915.729166666664 | 13.45 |
| 44915.739583333336 | 13.2 |
| 44915.75 | 13.7 |
| 44915.760416666664 | 13.36 |
| 44915.770833333336 | 13.22 |
| 44915.78125 | 13.15 |
| 44915.791666666664 | 12.82 |
| 44915.802083333336 | 13.05 |
| 44915.8125 | 12.79 |
| 44915.822916666664 | 12.75 |
| 44915.833333333336 | 12.73 |
| 44915.84375 | 12.83 |
| 44915.854166666664 | 12.91 |
| 44915.864583333336 | 13.2 |
| 44915.875 | 12.76 |
| 44915.885416666664 | 13.64 |
| 44915.895833333336 | 13.1 |
| 44915.90625 | 12.64 |
| 44915.916666666664 | 12.83 |
| 44915.927083333336 | 13.2 |
| 44915.9375 | 13.23 |
| 44915.947916666664 | 13.46 |
| 44915.958333333336 | 13.46 |
| 44915.96875 | 14.87 |
| 44915.979166666664 | 13.5 |
| 44915.989583333336 | 13.37 |
| 44916.0 | 13.34 |
| 44916.010416666664 | 13.16 |
| 44916.020833333336 | 13.16 |
| 44916.03125 | 13.19 |
| 44916.041666666664 | 13.46 |
| 44916.052083333336 | 13.53 |
| 44916.0625 | 13.46 |
| 44916.072916666664 | 13.76 |
| 44916.083333333336 | 13.92 |
| 44916.09375 | 14.09 |
| 44916.104166666664 | 14.28 |
| 44916.114583333336 | 14.17 |
| 44916.125 | 14.29 |
| 44916.135416666664 | 14.58 |
| 44916.145833333336 | 14.39 |
| 44916.15625 | 14.6 |
| 44916.166666666664 | 14.68 |
| 44916.177083333336 | 14.8 |
| 44916.1875 | 14.83 |
| 44916.197916666664 | 15.43 |
| 44916.208333333336 | 14.87 |
| 44916.21875 | 14.71 |
| 44916.229166666664 | 14.81 |
| 44916.239583333336 | 15.16 |
| 44916.25 | 14.9 |
| 44916.260416666664 | 14.73 |
| 44916.270833333336 | 14.55 |
| 44916.28125 | 14.2 |
| 44916.291666666664 | 13.89 |
| 44916.302083333336 | 14.06 |
| 44916.3125 | 13.84 |
| 44916.322916666664 | 13.68 |
| 44916.333333333336 | 13.66 |
| 44916.34375 | 13.79 |
| 44916.354166666664 | 13.57 |
| 44916.364583333336 | 13.5 |
| 44916.375 | 11.68 |
| 44916.385416666664 | 13.95 |
| 44916.395833333336 | 14.24 |
| 44916.40625 | 14.43 |
| 44916.416666666664 | 14.55 |
| 44916.427083333336 | 14.58 |
| 44916.4375 | 14.58 |
| 44916.447916666664 | 12.93 |
| 44916.458333333336 | 14.08 |
| 44916.46875 | 14.45 |
| 44916.479166666664 | 14.23 |
| 44916.489583333336 | 14.75 |
| 44916.5 | 15.39 |
| 44916.510416666664 | 14.71 |
| 44916.520833333336 | 14.12 |
| 44916.53125 | 13.86 |
| 44916.541666666664 | 14.07 |
| 44916.552083333336 | 14.05 |
| 44916.5625 | 13.21 |
| 44916.572916666664 | 13.33 |
| 44916.583333333336 | 13.22 |
| 44916.59375 | 13.08 |
| 44916.604166666664 | 13.02 |
| 44916.614583333336 | 13.16 |
| 44916.625 | 13.05 |
| 44916.635416666664 | 12.99 |
| 44916.645833333336 | 12.91 |
| 44916.65625 | 13.11 |
| 44916.666666666664 | 12.95 |
| 44916.677083333336 | 13.15 |
| 44916.6875 | 13.4 |
| 44916.697916666664 | 13.03 |
| 44916.708333333336 | 13.2 |
| 44916.71875 | 13.29 |
| 44916.729166666664 | 13.21 |
| 44916.739583333336 | 13 |
| 44916.75 | 13.59 |
| 44916.760416666664 | 13.17 |
| 44916.770833333336 | 13.15 |
| 44916.78125 | 13.21 |
| 44916.791666666664 | 13.11 |
| 44916.802083333336 | 13.11 |
| 44916.8125 | 13.53 |
| 44916.822916666664 | 13.19 |
| 44916.833333333336 | 13.4 |
| 44916.84375 | 13.17 |
| 44916.854166666664 | 13.23 |
| 44916.864583333336 | 13.59 |
| 44916.875 | 13.49 |
| 44916.885416666664 | 13.55 |
| 44916.895833333336 | 13.51 |
| 44916.90625 | 13.56 |
| 44916.916666666664 | 13.38 |
| 44916.927083333336 | 13.36 |
| 44916.9375 | 13.67 |
| 44916.947916666664 | 13.83 |
| 44916.958333333336 | 15.02 |
| 44916.96875 | 13.61 |
| 44916.979166666664 | 16.4 |
| 44916.989583333336 | 14.14 |
| 44917.0 | 14.46 |
| 44917.010416666664 | 14.11 |
| 44917.020833333336 | 15.18 |
| 44917.03125 | 14.23 |
| 44917.041666666664 | 14.49 |
| 44917.052083333336 | 14.05 |
| 44917.0625 | 13.79 |
| 44917.072916666664 | 13.87 |
| 44917.083333333336 | 13.9 |
| 44917.09375 | 14.16 |
| 44917.104166666664 | 14.15 |
| 44917.114583333336 | 14.03 |
| 44917.125 | 14.07 |
| 44917.135416666664 | 14.13 |
| 44917.145833333336 | 14.32 |
| 44917.15625 | 14.41 |
| 44917.166666666664 | 14.53 |
| 44917.177083333336 | 14.45 |
| 44917.1875 | 14.69 |
| 44917.197916666664 | 14.93 |
| 44917.208333333336 | 14.76 |
| 44917.21875 | 15 |
| 44917.229166666664 | 15.21 |
| 44917.239583333336 | 15.21 |
| 44917.25 | 15.5 |
| 44917.260416666664 | 14.8 |
| 44917.270833333336 | 15.14 |
| 44917.28125 | 15.3 |
| 44917.291666666664 | 14.92 |
| 44917.302083333336 | 15 |
| 44917.3125 | 14.59 |
| 44917.322916666664 | 14.35 |
| 44917.333333333336 | 14.41 |
| 44917.34375 | 14.43 |
| 44917.354166666664 | 14.35 |
| 44917.364583333336 | 14.14 |
| 44917.375 | 14.43 |
| 44917.385416666664 | 14.02 |
| 44917.395833333336 | 14.32 |
| 44917.40625 | 14.46 |
| 44917.416666666664 | 14.52 |
| 44917.427083333336 | 14.57 |
| 44917.4375 | 15.13 |
| 44917.447916666664 | 14.99 |
| 44917.458333333336 | 14.3 |
| 44917.46875 | 15.38 |
| 44917.479166666664 | 15.06 |
| 44917.489583333336 | 14.75 |
| 44917.5 | 15.22 |
| 44917.510416666664 | 14.86 |
| 44917.520833333336 | 14.79 |
| 44917.53125 | 15.06 |
| 44917.541666666664 | 14.95 |
| 44917.552083333336 | 14.59 |
| 44917.5625 | 14.11 |
| 44917.572916666664 | 14.09 |
| 44917.583333333336 | 13.94 |
| 44917.59375 | 14 |
| 44917.604166666664 | 13.21 |
| 44917.614583333336 | 12.26 |
| 44917.625 | 13.54 |
| 44917.635416666664 | 13.65 |
| 44917.645833333336 | 13.6 |
| 44917.65625 | 13.99 |
| 44917.666666666664 | 14.23 |
| 44917.677083333336 | 13.79 |
| 44917.6875 | 13.57 |
| 44917.697916666664 | 13.84 |
| 44917.708333333336 | 13.86 |
| 44917.71875 | 14.24 |
| 44917.729166666664 | 14.6 |
| 44917.739583333336 | 15.85 |
| 44917.75 | 15.99 |
| 44917.760416666664 | 15.43 |
| 44917.770833333336 | 15.48 |
| 44917.78125 | 15.33 |
| 44917.791666666664 | 15.55 |
| 44917.802083333336 | 15.79 |
| 44917.8125 | 14.31 |
| 44917.822916666664 | 15.03 |
| 44917.833333333336 | 15.45 |
| 44917.84375 | 15.29 |
| 44917.854166666664 | 14.64 |
| 44917.864583333336 | 14.83 |
| 44917.875 | 15.3 |
| 44917.885416666664 | 14.94 |
| 44917.895833333336 | 14.63 |
| 44917.90625 | 15.42 |
| 44917.916666666664 | 14.23 |
| 44917.927083333336 | 14.39 |
| 44917.9375 | 15.09 |
| 44917.947916666664 | 15.18 |
| 44917.958333333336 | 15.06 |
| 44917.96875 | 15.32 |
| 44917.979166666664 | 14.88 |
| 44917.989583333336 | 14.85 |
| 44918.0 | 15.31 |
| 44918.010416666664 | 16.01 |
| 44918.020833333336 | 15.89 |
| 44918.03125 | 14.81 |
| 44918.041666666664 | 14.82 |
| 44918.052083333336 | 14.93 |
| 44918.0625 | 15.04 |
| 44918.072916666664 | 15.01 |
| 44918.083333333336 | 15.23 |
| 44918.09375 | 14.68 |
| 44918.104166666664 | 14.58 |
| 44918.114583333336 | 14.33 |
| 44918.125 | 14.29 |
| 44918.135416666664 | 14.1 |
| 44918.145833333336 | 14.33 |
| 44918.15625 | 14.02 |
| 44918.166666666664 | 14.46 |
| 44918.177083333336 | 14.31 |
| 44918.1875 | 13.81 |
| 44918.197916666664 | 14.2 |
| 44918.208333333336 | 14.33 |
| 44918.21875 | 14.64 |
| 44918.229166666664 | 15.94 |
| 44918.239583333336 | 15.46 |
| 44918.25 | 15.61 |
| 44918.260416666664 | 15.33 |
| 44918.270833333336 | 16.05 |
| 44918.28125 | 16.38 |
| 44918.291666666664 | 16.17 |
| 44918.302083333336 | 15.39 |
| 44918.3125 | 15.39 |
| 44918.322916666664 | 15.2 |
| 44918.333333333336 | 15.47 |
| 44918.34375 | 15.41 |
| 44918.354166666664 | 15.53 |
| 44918.364583333336 | 12.96 |
| 44918.375 | 15.84 |
| 44918.385416666664 | 15.53 |
| 44918.395833333336 | 15.74 |
| 44918.40625 | 16.32 |
| 44918.416666666664 | 15.03 |
| 44918.427083333336 | 17.2 |
| 44918.4375 | 17.47 |
| 44918.447916666664 | 17.29 |
| 44918.458333333336 | 16.45 |
| 44918.46875 | 16.41 |
| 44918.479166666664 | 16.21 |
| 44918.489583333336 | 15.8 |
| 44918.5 | 15.3 |
| 44918.510416666664 | 15.71 |
| 44918.520833333336 | 15.04 |
| 44918.53125 | 16.68 |
| 44918.541666666664 | 15.49 |
| 44918.552083333336 | 15.81 |
| 44918.5625 | 15.48 |
| 44918.572916666664 | 15.42 |
| 44918.583333333336 | 15.37 |
| 44918.59375 | 14.99 |
| 44918.604166666664 | 14.14 |
| 44918.614583333336 | 15.07 |
| 44918.625 | 14.13 |
| 44918.635416666664 | 15.33 |
| 44918.645833333336 | 15.28 |
| 44918.65625 | 14.36 |
| 44918.666666666664 | 14.33 |
| 44918.677083333336 | 14.31 |
| 44918.6875 | 13.64 |
| 44918.697916666664 | 13.88 |
| 44918.708333333336 | 14.46 |
| 44918.71875 | 14.08 |
| 44918.729166666664 | 14.54 |
| 44918.739583333336 | 16.05 |
| 44918.75 | 14.97 |
| 44918.760416666664 | 17.57 |
| 44918.770833333336 | 18.12 |
| 44918.78125 | 17.57 |
| 44918.791666666664 | 19.81 |
| 44918.802083333336 | 21.29 |
| 44918.8125 | 18.15 |
| 44918.822916666664 | 20.36 |
| 44918.833333333336 | 19.03 |
| 44918.84375 | 18.67 |
| 44918.854166666664 | 18.09 |
| 44918.864583333336 | 17.93 |
| 44918.875 | 17.86 |
| 44918.885416666664 | 17.04 |
| 44918.895833333336 | 17.92 |
| 44918.90625 | 20.61 |
| 44918.916666666664 | 19.52 |
| 44918.927083333336 | 19.29 |
| 44918.9375 | 20.16 |
| 44918.947916666664 | 19.99 |
| 44918.958333333336 | 19.98 |
| 44918.96875 | 23.4 |
| 44918.979166666664 | 21.24 |
| 44918.989583333336 | 22.48 |
| 44919.0 | 23.83 |
| 44919.010416666664 | 23.94 |
| 44919.020833333336 | 23.66 |
| 44919.03125 | 23.2 |
| 44919.041666666664 | 22.61 |
| 44919.052083333336 | 22.79 |
| 44919.0625 | 20.82 |
| 44919.072916666664 | 22.39 |
| 44919.083333333336 | 18.92 |
| 44919.09375 | 19.47 |
| 44919.104166666664 | 21.2 |
| 44919.114583333336 | 21.02 |
| 44919.125 | 21.44 |
| 44919.135416666664 | 25.78 |
| 44919.145833333336 | 24.32 |
| 44919.15625 | 22.35 |
| 44919.166666666664 | 21.42 |
| 44919.177083333336 | 20.32 |
| 44919.1875 | 19.1 |
| 44919.197916666664 | 18.77 |
| 44919.208333333336 | 18.83 |
| 44919.21875 | 20.44 |
| 44919.229166666664 | 21.25 |
| 44919.239583333336 | 20.05 |
| 44919.25 | 20.03 |
| 44919.260416666664 | 19.43 |
| 44919.270833333336 | 20 |
| 44919.28125 | 20.24 |
| 44919.291666666664 | 20.35 |
| 44919.302083333336 | 21 |
| 44919.3125 | 21.02 |
| 44919.322916666664 | 22.26 |
| 44919.333333333336 | 19.55 |
| 44919.34375 | 19.94 |
| 44919.354166666664 | 20.09 |
| 44919.364583333336 | 19.34 |
| 44919.375 | 19.79 |
| 44919.385416666664 | 20.49 |
| 44919.395833333336 | 23.76 |
| 44919.40625 | 28.86 |
| 44919.416666666664 | 27.32 |
| 44919.427083333336 | 27.28 |
| 44919.4375 | 26.74 |
| 44919.447916666664 | 26.21 |
| 44919.458333333336 | 29.04 |
| 44919.46875 | 27.16 |
| 44919.479166666664 | 25.15 |
| 44919.489583333336 | 26.46 |
| 44919.5 | 25.87 |
| 44919.510416666664 | 25.75 |
| 44919.520833333336 | 26.66 |
| 44919.53125 | 25.9 |
| 44919.541666666664 | 25.94 |
| 44919.552083333336 | 27.09 |
| 44919.5625 | 25.21 |
| 44919.572916666664 | 21.65 |
| 44919.583333333336 | 26.45 |
| 44919.59375 | 22.72 |
| 44919.604166666664 | 22.23 |
| 44919.614583333336 | 23.2 |
| 44919.625 | 20.46 |
| 44919.635416666664 | 19.94 |
| 44919.645833333336 | 19.11 |
| 44919.65625 | 19.18 |
| 44919.666666666664 | 20.43 |
| 44919.677083333336 | 20.71 |
| 44919.6875 | 19.31 |
| 44919.697916666664 | 20.26 |
| 44919.708333333336 | 20.15 |
| 44919.71875 | 21.12 |
| 44919.729166666664 | 20.71 |
| 44919.739583333336 | 21.57 |
| 44919.75 | 22.78 |
| 44919.760416666664 | 23.46 |
| 44919.770833333336 | 22.19 |
| 44919.78125 | 21.44 |
| 44919.791666666664 | 21.77 |
| 44919.802083333336 | 21.61 |
| 44919.8125 | 21.19 |
| 44919.822916666664 | 21.3 |
| 44919.833333333336 | 21.2 |
| 44919.84375 | 20.61 |
| 44919.854166666664 | 21.31 |
| 44919.864583333336 | 20.83 |
| 44919.875 | 21.45 |
| 44919.885416666664 | 22.1 |
| 44919.895833333336 | 22.3 |
| 44919.90625 | 21.63 |
| 44919.916666666664 | 21.65 |
| 44919.927083333336 | 22.6 |
| 44919.9375 | 24.78 |
| 44919.947916666664 | 25.88 |
| 44919.958333333336 | 25.97 |
| 44919.96875 | 25.25 |
| 44919.979166666664 | 24.89 |
| 44919.989583333336 | 24.96 |
| 44920.0 | 31.44 |
| 44920.010416666664 | 24.57 |
| 44920.020833333336 | 23.84 |
| 44920.03125 | 24.36 |
| 44920.041666666664 | 24.77 |
| 44920.052083333336 | 23.93 |
| 44920.0625 | 23.95 |
| 44920.072916666664 | 24.15 |
| 44920.083333333336 | 38.85 |
| 44920.09375 | 24.47 |
| 44920.104166666664 | 23.75 |
| 44920.114583333336 | 23.34 |
| 44920.125 | 23.3 |
| 44920.135416666664 | 23.31 |
| 44920.145833333336 | 23.43 |
| 44920.15625 | 22.87 |
| 44920.166666666664 | 24.12 |
| 44920.177083333336 | 23.34 |
| 44920.1875 | 23.77 |
| 44920.197916666664 | 22.84 |
| 44920.208333333336 | 23.67 |
| 44920.21875 | 24.05 |
| 44920.229166666664 | 24.03 |
| 44920.239583333336 | 23.89 |
| 44920.25 | 23.93 |
| 44920.260416666664 | 23.43 |
| 44920.270833333336 | 22.95 |
| 44920.28125 | 23.11 |
| 44920.291666666664 | 23.25 |
| 44920.302083333336 | 22.98 |
| 44920.3125 | 23.16 |
| 44920.322916666664 | 23.24 |
| 44920.333333333336 | 23.14 |
| 44920.34375 | 23.88 |
| 44920.354166666664 | 22.97 |
| 44920.364583333336 | 22.76 |
| 44920.375 | 22.56 |
| 44920.385416666664 | 22.75 |
| 44920.395833333336 | 22.44 |
| 44920.40625 | 22.63 |
| 44920.416666666664 | 22.13 |
| 44920.427083333336 | 23.14 |
| 44920.4375 | 23.43 |
| 44920.447916666664 | 24.45 |
| 44920.458333333336 | 24.49 |
| 44920.46875 | 24.37 |
| 44920.479166666664 | 24.74 |
| 44920.489583333336 | 23.7 |
| 44920.5 | 24.24 |
| 44920.510416666664 | 24.26 |
| 44920.520833333336 | 25.07 |
| 44920.53125 | 24.79 |
| 44920.541666666664 | 23.96 |
| 44920.552083333336 | 23.6 |
| 44920.5625 | 22.56 |
| 44920.572916666664 | 23.23 |
| 44920.583333333336 | 20.85 |
| 44920.59375 | 20.81 |
| 44920.604166666664 | 20.27 |
| 44920.614583333336 | 20.42 |
| 44920.625 | 20.42 |
| 44920.635416666664 | 21.59 |
| 44920.645833333336 | 19.49 |
| 44920.65625 | 19.12 |
| 44920.666666666664 | 18.85 |
| 44920.677083333336 | 18.65 |
| 44920.6875 | 18.52 |
| 44920.697916666664 | 18.89 |
| 44920.708333333336 | 18.63 |
| 44920.71875 | 18.8 |
| 44920.729166666664 | 17.18 |
| 44920.739583333336 | 19.53 |
| 44920.75 | 19.51 |
| 44920.760416666664 | 19.99 |
| 44920.770833333336 | 19.23 |
| 44920.78125 | 20.26 |
| 44920.791666666664 | 19.39 |
| 44920.802083333336 | 19.78 |
| 44920.8125 | 19.88 |
| 44920.822916666664 | 19.93 |
| 44920.833333333336 | 19.83 |
| 44920.84375 | 19.85 |
| 44920.854166666664 | 20.38 |
| 44920.864583333336 | 21.14 |
| 44920.875 | 21.56 |
| 44920.885416666664 | 21.26 |
| 44920.895833333336 | 20.96 |
| 44920.90625 | 21.18 |
| 44920.916666666664 | 21.09 |
| 44920.927083333336 | 22.39 |
| 44920.9375 | 21.53 |
| 44920.947916666664 | 21.86 |
| 44920.958333333336 | 22.32 |
| 44920.96875 | 21.43 |
| 44920.979166666664 | 21.92 |
| 44920.989583333336 | 22.34 |
| 44921.0 | 22.39 |
| 44921.010416666664 | 22.33 |
| 44921.020833333336 | 22.38 |
| 44921.03125 | 22.21 |
| 44921.041666666664 | 22.47 |
| 44921.052083333336 | 22.52 |
| 44921.0625 | 22.66 |
| 44921.072916666664 | 22.32 |
| 44921.083333333336 | 22.63 |
| 44921.09375 | 22.25 |
| 44921.104166666664 | 22.98 |
| 44921.114583333336 | 22.95 |
| 44921.125 | 23.52 |
| 44921.135416666664 | 23.51 |
| 44921.145833333336 | 23.69 |
| 44921.15625 | 24.06 |
| 44921.166666666664 | 23.22 |
| 44921.177083333336 | 22.66 |
| 44921.1875 | 22.38 |
| 44921.197916666664 | 22.7 |
| 44921.208333333336 | 22.37 |
| 44921.21875 | 22.7 |
| 44921.229166666664 | 22.93 |
| 44921.239583333336 | 22.55 |
| 44921.25 | 23.48 |
| 44921.260416666664 | 23.24 |
| 44921.270833333336 | 23.11 |
| 44921.28125 | 22.86 |
| 44921.291666666664 | 23.16 |
| 44921.302083333336 | 22.89 |
| 44921.3125 | 23.1 |
| 44921.322916666664 | 22.57 |
| 44921.333333333336 | 22.79 |
| 44921.34375 | 22.66 |
| 44921.354166666664 | 23.7 |
| 44921.364583333336 | 23.03 |
| 44921.375 | 38.47 |
| 44921.385416666664 | 22.29 |
| 44921.395833333336 | 22.35 |
| 44921.40625 | 21.96 |
| 44921.416666666664 | 21.69 |
| 44921.427083333336 | 22.17 |
| 44921.4375 | 22.59 |
| 44921.447916666664 | 22.48 |
| 44921.458333333336 | 22.61 |
| 44921.46875 | 22.75 |
| 44921.479166666664 | 22.78 |
| 44921.489583333336 | 23.3 |
| 44921.5 | 23.24 |
| 44921.510416666664 | 23.83 |
| 44921.520833333336 | 23.8 |
| 44921.53125 | 23.16 |
| 44921.541666666664 | 22.1 |
| 44921.552083333336 | 21.92 |
| 44921.5625 | 20.92 |
| 44921.572916666664 | 18.29 |
| 44921.583333333336 | 20.29 |
| 44921.59375 | 19.51 |
| 44921.604166666664 | 19.96 |
| 44921.614583333336 | 19.2 |
| 44921.625 | 19.51 |
| 44921.635416666664 | 19.36 |
| 44921.645833333336 | 18.95 |
| 44921.65625 | 18.91 |
| 44921.666666666664 | 18.84 |
| 44921.677083333336 | 19.37 |
| 44921.6875 | 18.4 |
| 44921.697916666664 | 18.33 |
| 44921.708333333336 | 17.91 |
| 44921.71875 | 17.57 |
| 44921.729166666664 | 17.7 |
| 44921.739583333336 | 17.79 |
| 44921.75 | 18.24 |
| 44921.760416666664 | 17.66 |
| 44921.770833333336 | 17.86 |
| 44921.78125 | 18.52 |
| 44921.791666666664 | 18.15 |
| 44921.802083333336 | 18.07 |
| 44921.8125 | 18.81 |
| 44921.822916666664 | 19.14 |
| 44921.833333333336 | 19.37 |
| 44921.84375 | 19.82 |
| 44921.854166666664 | 19.75 |
| 44921.864583333336 | 21.31 |
| 44921.875 | 21.34 |
| 44921.885416666664 | 21.33 |
| 44921.895833333336 | 21.45 |
| 44921.90625 | 21.62 |
| 44921.916666666664 | 23.67 |
| 44921.927083333336 | 21.87 |
| 44921.9375 | 21.69 |
| 44921.947916666664 | 21.6 |
| 44921.958333333336 | 21.98 |
| 44921.96875 | 49.08 |
| 44921.979166666664 | 22.01 |
| 44921.989583333336 | 21.81 |
| 44922.0 | 21.75 |
| 44922.010416666664 | 21.79 |
| 44922.020833333336 | 21.6 |
| 44922.03125 | 21.72 |
| 44922.041666666664 | 21.36 |
| 44922.052083333336 | 21.73 |
| 44922.0625 | 21.89 |
| 44922.072916666664 | 22.31 |
| 44922.083333333336 | 21.99 |
| 44922.09375 | 22.22 |
| 44922.104166666664 | 21.97 |
| 44922.114583333336 | 22.7 |
| 44922.125 | 22.89 |
| 44922.135416666664 | 22.31 |
| 44922.145833333336 | 22.39 |
| 44922.15625 | 22.79 |
| 44922.166666666664 | 23.3 |
| 44922.177083333336 | 22.7 |
| 44922.1875 | 23.95 |
| 44922.197916666664 | 22.71 |
| 44922.208333333336 | 21.99 |
| 44922.21875 | 22.54 |
| 44922.229166666664 | 22.64 |
| 44922.239583333336 | 22.82 |
| 44922.25 | 22.44 |
| 44922.260416666664 | 22.47 |
| 44922.270833333336 | 22.61 |
| 44922.28125 | 22.86 |
| 44922.291666666664 | 23.39 |
| 44922.302083333336 | 23.15 |
| 44922.3125 | 22.94 |
| 44922.322916666664 | 23.02 |
| 44922.333333333336 | 22.59 |
| 44922.34375 | 22.53 |
| 44922.354166666664 | 22.7 |
| 44922.364583333336 | 22.45 |
| 44922.375 | 22.49 |
| 44922.385416666664 | 22.79 |
| 44922.395833333336 | 22.49 |
| 44922.40625 | 22.66 |
| 44922.416666666664 | 23.42 |
| 44922.427083333336 | 23.19 |
| 44922.4375 | 22.88 |
| 44922.447916666664 | 22.26 |
| 44922.458333333336 | 22.43 |
| 44922.46875 | 21.93 |
| 44922.479166666664 | 22.41 |
| 44922.489583333336 | 22.49 |
| 44922.5 | 22.41 |
| 44922.510416666664 | 22.74 |
| 44922.520833333336 | 23.11 |
| 44922.53125 | 22.87 |
| 44922.541666666664 | 20.81 |
| 44922.552083333336 | 20.41 |
| 44922.5625 | 20.39 |
| 44922.572916666664 | 19.41 |
| 44922.583333333336 | 18.52 |
| 44922.59375 | 18.98 |
| 44922.604166666664 | 18.15 |
| 44922.614583333336 | 18.13 |
| 44922.625 | 17.81 |
| 44922.635416666664 | 18.02 |
| 44922.645833333336 | 18.52 |
| 44922.65625 | 17.38 |
| 44922.666666666664 | 17.35 |
| 44922.677083333336 | 17.39 |
| 44922.6875 | 17.58 |
| 44922.697916666664 | 17.14 |
| 44922.708333333336 | 17.19 |
| 44922.71875 | 18.01 |
| 44922.729166666664 | 16.5 |
| 44922.739583333336 | 16.32 |
| 44922.75 | 16.36 |
| 44922.760416666664 | 16 |
| 44922.770833333336 | 16.47 |
| 44922.78125 | 16.56 |
| 44922.791666666664 | 16.89 |
| 44922.802083333336 | 16.88 |
| 44922.8125 | 16.94 |
| 44922.822916666664 | 16.84 |
| 44922.833333333336 | 17.77 |
| 44922.84375 | 18.26 |
| 44922.854166666664 | 18.12 |
| 44922.864583333336 | 18.47 |
| 44922.875 | 19.3 |
| 44922.885416666664 | 20.17 |
| 44922.895833333336 | 20.31 |
| 44922.90625 | 20.23 |
| 44922.916666666664 | 20.31 |
| 44922.927083333336 | 19.7 |
| 44922.9375 | 20.49 |
| 44922.947916666664 | 20.96 |
| 44922.958333333336 | 21.22 |
| 44922.96875 | 20.04 |
| 44922.979166666664 | 20.36 |
| 44922.989583333336 | 20.5 |
| 44923.0 | 20.63 |
| 44923.010416666664 | 20.59 |
| 44923.020833333336 | 20.91 |
| 44923.03125 | 21.01 |
| 44923.041666666664 | 22.87 |
| 44923.052083333336 | 21.33 |
| 44923.0625 | 19.79 |
| 44923.072916666664 | 21.52 |
| 44923.083333333336 | 21.22 |
| 44923.09375 | 21.74 |
| 44923.104166666664 | 21.06 |
| 44923.114583333336 | 21.33 |
| 44923.125 | 21.41 |
| 44923.135416666664 | 21.65 |
| 44923.145833333336 | 21.64 |
| 44923.15625 | 22.02 |
| 44923.166666666664 | 21.92 |
| 44923.177083333336 | 22.1 |
| 44923.1875 | 22.5 |
| 44923.197916666664 | 23.15 |
| 44923.208333333336 | 24.19 |
| 44923.21875 | 26.24 |
| 44923.229166666664 | 23.08 |
| 44923.239583333336 | 22.2 |
| 44923.25 | 22.33 |
| 44923.260416666664 | 21.95 |
| 44923.270833333336 | 21.79 |
| 44923.28125 | 21.54 |
| 44923.291666666664 | 22.08 |
| 44923.302083333336 | 22 |
| 44923.3125 | 22.13 |
| 44923.322916666664 | 22.25 |
| 44923.333333333336 | 22.56 |
| 44923.34375 | 22.02 |
| 44923.354166666664 | 22.2 |
| 44923.364583333336 | 22.27 |
| 44923.375 | 21.99 |
| 44923.385416666664 | 21.67 |
| 44923.395833333336 | 22.6 |
| 44923.40625 | 22.07 |
| 44923.416666666664 | 22.12 |
| 44923.427083333336 | 21.91 |
| 44923.4375 | 21.88 |
| 44923.447916666664 | 22.28 |
| 44923.458333333336 | 23.38 |
| 44923.46875 | 24.46 |
| 44923.479166666664 | 22.47 |
| 44923.489583333336 | 20.81 |
| 44923.5 | 21.98 |
| 44923.510416666664 | 23.1 |
| 44923.520833333336 | 23.01 |
| 44923.53125 | 22.6 |
| 44923.541666666664 | 22.31 |
| 44923.552083333336 | 21.11 |
| 44923.5625 | 19.84 |
| 44923.572916666664 | 18.93 |
| 44923.583333333336 | 18.39 |
| 44923.59375 | 18.31 |
| 44923.604166666664 | 17.6 |
| 44923.614583333336 | 17.39 |
| 44923.625 | 17.66 |
| 44923.635416666664 | 17.24 |
| 44923.645833333336 | 17.14 |
| 44923.65625 | 16.96 |
| 44923.666666666664 | 16.6 |
| 44923.677083333336 | 16.75 |
| 44923.6875 | 16.69 |
| 44923.697916666664 | 15.45 |
| 44923.708333333336 | 16.51 |
| 44923.71875 | 16.27 |
| 44923.729166666664 | 16.35 |
| 44923.739583333336 | 16.53 |
| 44923.75 | 16.7 |
| 44923.760416666664 | 16.4 |
| 44923.770833333336 | 16.03 |
| 44923.78125 | 16.47 |
| 44923.791666666664 | 16.33 |
| 44923.802083333336 | 16.27 |
| 44923.8125 | 17.6 |
| 44923.822916666664 | 17.6 |
| 44923.833333333336 | 17.74 |
| 44923.84375 | 17.76 |
| 44923.854166666664 | 18.14 |
| 44923.864583333336 | 18.71 |
| 44923.875 | 19.39 |
| 44923.885416666664 | 19.69 |
| 44923.895833333336 | 20 |
| 44923.90625 | 20.1 |
| 44923.916666666664 | 19.94 |
| 44923.927083333336 | 20.02 |
| 44923.9375 | 19.96 |
| 44923.947916666664 | 19.81 |
| 44923.958333333336 | 20.24 |
| 44923.96875 | 20.04 |
| 44923.979166666664 | 22.14 |
| 44923.989583333336 | 21.41 |
| 44924.0 | 21.64 |
| 44924.010416666664 | 20.56 |
| 44924.020833333336 | 20.89 |
| 44924.03125 | 20.56 |
| 44924.041666666664 | 20.62 |
| 44924.052083333336 | 20.62 |
| 44924.0625 | 20.96 |
| 44924.072916666664 | 21.35 |
| 44924.083333333336 | 21.04 |
| 44924.09375 | 21.68 |
| 44924.104166666664 | 21.9 |
| 44924.114583333336 | 21.4 |
| 44924.125 | 21.23 |
| 44924.135416666664 | 21.33 |
| 44924.145833333336 | 21.53 |
| 44924.15625 | 21.69 |
| 44924.166666666664 | 21.47 |
| 44924.177083333336 | 22.17 |
| 44924.1875 | 21.62 |
| 44924.197916666664 | 21.77 |
| 44924.208333333336 | 21.6 |
| 44924.21875 | 21.52 |
| 44924.229166666664 | 21.36 |
| 44924.239583333336 | 22.37 |
| 44924.25 | 22.26 |
| 44924.260416666664 | 22.91 |
| 44924.270833333336 | 21.77 |
| 44924.28125 | 22.35 |
| 44924.291666666664 | 21.82 |
| 44924.302083333336 | 21.44 |
| 44924.3125 | 22.82 |
| 44924.322916666664 | 21.22 |
| 44924.333333333336 | 22.11 |
| 44924.34375 | 22.34 |
| 44924.354166666664 | 22 |
| 44924.364583333336 | 22.19 |
| 44924.375 | 22.63 |
| 44924.385416666664 | 22.09 |
| 44924.395833333336 | 22.14 |
| 44924.40625 | 21.73 |
| 44924.416666666664 | 21.92 |
| 44924.427083333336 | 21.75 |
| 44924.4375 | 21.7 |
| 44924.447916666664 | 21.85 |
| 44924.458333333336 | 21.94 |
| 44924.46875 | 21.37 |
| 44924.479166666664 | 22.07 |
| 44924.489583333336 | 22.13 |
| 44924.5 | 22.59 |
| 44924.510416666664 | 25 |
| 44924.520833333336 | 21.89 |
| 44924.53125 | 22.05 |
| 44924.541666666664 | 22.51 |
| 44924.552083333336 | 22.16 |
| 44924.5625 | 19.65 |
| 44924.572916666664 | 20.43 |
| 44924.583333333336 | 18.98 |
| 44924.59375 | 18.85 |
| 44924.604166666664 | 17.65 |
| 44924.614583333336 | 17.46 |
| 44924.625 | 16.93 |
| 44924.635416666664 | 16.48 |
| 44924.645833333336 | 16.74 |
| 44924.65625 | 16.64 |
| 44924.666666666664 | 16.47 |
| 44924.677083333336 | 16.67 |
| 44924.6875 | 16.15 |
| 44924.697916666664 | 15.98 |
| 44924.708333333336 | 15.8 |
| 44924.71875 | 16.24 |
| 44924.729166666664 | 15.81 |
| 44924.739583333336 | 16.02 |
| 44924.75 | 15.59 |
| 44924.760416666664 | 15.71 |
| 44924.770833333336 | 15.89 |
| 44924.78125 | 16.65 |
| 44924.791666666664 | 17.74 |
| 44924.802083333336 | 17.89 |
| 44924.8125 | 17 |
| 44924.822916666664 | 16.77 |
| 44924.833333333336 | 16.62 |
| 44924.84375 | 17.82 |
| 44924.854166666664 | 18.68 |
| 44924.864583333336 | 19.38 |
| 44924.875 | 19.55 |
| 44924.885416666664 | 19.59 |
| 44924.895833333336 | 19.6 |
| 44924.90625 | 19.53 |
| 44924.916666666664 | 19.89 |
| 44924.927083333336 | 20.33 |
| 44924.9375 | 20.65 |
| 44924.947916666664 | 20.45 |
| 44924.958333333336 | 20.39 |
| 44924.96875 | 20.65 |
| 44924.979166666664 | 20.81 |
| 44924.989583333336 | 20.88 |
| 44925.0 | 20.44 |
| 44925.010416666664 | 20.83 |
| 44925.020833333336 | 22.85 |
| 44925.03125 | 22.19 |
| 44925.041666666664 | 20.62 |
| 44925.052083333336 | 21.12 |
| 44925.0625 | 21.24 |
| 44925.072916666664 | 20.96 |
| 44925.083333333336 | 21.08 |
| 44925.09375 | 20.65 |
| 44925.104166666664 | 20.89 |
| 44925.114583333336 | 20.88 |
| 44925.125 | 19.81 |
| 44925.135416666664 | 20.63 |
| 44925.145833333336 | 20.33 |
| 44925.15625 | 20.48 |
| 44925.166666666664 | 20.56 |
| 44925.177083333336 | 21.12 |
| 44925.1875 | 21.11 |
| 44925.197916666664 | 20.92 |
| 44925.208333333336 | 21.43 |
| 44925.21875 | 21.34 |
| 44925.229166666664 | 33.27 |
| 44925.239583333336 | 21.57 |
| 44925.25 | 21.33 |
| 44925.260416666664 | 21.43 |
| 44925.270833333336 | 21.36 |
| 44925.28125 | 21.79 |
| 44925.291666666664 | 22.27 |
| 44925.302083333336 | 20.93 |
| 44925.3125 | 21.35 |
| 44925.322916666664 | 20.97 |
| 44925.333333333336 | 21.1 |
| 44925.34375 | 21.42 |
| 44925.354166666664 | 21.28 |
| 44925.364583333336 | 21.34 |
| 44925.375 | 21.03 |
| 44925.385416666664 | 20.82 |
| 44925.395833333336 | 20.88 |
| 44925.40625 | 20.68 |
| 44925.416666666664 | 21.25 |
| 44925.427083333336 | 20.6 |
| 44925.4375 | 21.42 |
| 44925.447916666664 | 21.21 |
| 44925.458333333336 | 21.18 |
| 44925.46875 | 21.23 |
| 44925.479166666664 | 21.04 |
| 44925.489583333336 | 20.95 |
| 44925.5 | 21.26 |
| 44925.510416666664 | 21.55 |
| 44925.520833333336 | 22.96 |
| 44925.53125 | 21.54 |
| 44925.541666666664 | 21.66 |
| 44925.552083333336 | 19.21 |
| 44925.5625 | 19.66 |
| 44925.572916666664 | 19.57 |
| 44925.583333333336 | 18.74 |
| 44925.59375 | 18.07 |
| 44925.604166666664 | 17.33 |
| 44925.614583333336 | 17 |
| 44925.625 | 16.49 |
| 44925.635416666664 | 16.37 |
| 44925.645833333336 | 16.16 |
| 44925.65625 | 16.17 |
| 44925.666666666664 | 15.96 |
| 44925.677083333336 | 15.71 |
| 44925.6875 | 15.41 |
| 44925.697916666664 | 15.52 |
| 44925.708333333336 | 15.18 |
| 44925.71875 | 15.19 |
| 44925.729166666664 | 15.13 |
| 44925.739583333336 | 15.1 |
| 44925.75 | 15.02 |
| 44925.760416666664 | 14.72 |
| 44925.770833333336 | 15 |
| 44925.78125 | 15.19 |
| 44925.791666666664 | 15.55 |
| 44925.802083333336 | 15.22 |
| 44925.8125 | 16.74 |
| 44925.822916666664 | 17.94 |
| 44925.833333333336 | 18.86 |
| 44925.84375 | 18.69 |
| 44925.854166666664 | 18.38 |
| 44925.864583333336 | 18.79 |
| 44925.875 | 24.25 |
| 44925.885416666664 | 18.37 |
| 44925.895833333336 | 18.54 |
| 44925.90625 | 18.79 |
| 44925.916666666664 | 19.33 |
| 44925.927083333336 | 19.1 |
| 44925.9375 | 20.08 |
| 44925.947916666664 | 19.86 |
| 44925.958333333336 | 19.13 |
| 44925.96875 | 19.83 |
| 44925.979166666664 | 19.88 |
| 44925.989583333336 | 19.81 |
| 44926.0 | 20.23 |
| 44926.010416666664 | 20.03 |
| 44926.020833333336 | 20.32 |
| 44926.03125 | 20.26 |
| 44926.041666666664 | 20.28 |
| 44926.052083333336 | 20.53 |
| 44926.0625 | 21.41 |
| 44926.072916666664 | 24.92 |
| 44926.083333333336 | 20.98 |
| 44926.09375 | 37.67 |
| 44926.104166666664 | 20.4 |
| 44926.114583333336 | 20.7 |
| 44926.125 | 20.82 |
| 44926.135416666664 | 20.13 |
| 44926.145833333336 | 20.43 |
| 44926.15625 | 20.23 |
| 44926.166666666664 | 19.33 |
| 44926.177083333336 | 19.56 |
| 44926.1875 | 20.36 |
| 44926.197916666664 | 19.22 |
| 44926.208333333336 | 19.66 |
| 44926.21875 | 18.64 |
| 44926.229166666664 | 19.35 |
| 44926.239583333336 | 17.78 |
| 44926.25 | 19.03 |
| 44926.260416666664 | 18.96 |
| 44926.270833333336 | 19.71 |
| 44926.28125 | 20.35 |
| 44926.291666666664 | 19.81 |
| 44926.302083333336 | 18.94 |
| 44926.3125 | 19.76 |
| 44926.322916666664 | 20.8 |
| 44926.333333333336 | 19.14 |
| 44926.34375 | 20.32 |
| 44926.354166666664 | 20.3 |
| 44926.364583333336 | 19.38 |
| 44926.375 | 19.33 |
| 44926.385416666664 | 18.39 |
| 44926.395833333336 | 19.09 |
| 44926.40625 | 18.79 |
| 44926.416666666664 | 18.52 |
| 44926.427083333336 | 18.3 |
| 44926.4375 | 18.85 |
| 44926.447916666664 | 18.03 |
| 44926.458333333336 | 17.93 |
| 44926.46875 | 17.23 |
| 44926.479166666664 | 17.29 |
| 44926.489583333336 | 18.22 |
| 44926.5 | 18.13 |
| 44926.510416666664 | 18.76 |
| 44926.520833333336 | 18.65 |
| 44926.53125 | 19.39 |
| 44926.541666666664 | 19.42 |
| 44926.552083333336 | 19.24 |
| 44926.5625 | 19.58 |
| 44926.572916666664 | 19.16 |
| 44926.583333333336 | 20.99 |
| 44926.59375 | 20.99 |
| 44926.604166666664 | 20.4 |
| 44926.614583333336 | 20.63 |
| 44926.625 | 20.5 |
| 44926.635416666664 | 16.97 |
| 44926.645833333336 | 16.78 |
| 44926.65625 | 19.07 |
| 44926.666666666664 | 18.83 |
| 44926.677083333336 | 19.65 |
| 44926.6875 | 18.45 |
| 44926.697916666664 | 18.23 |
| 44926.708333333336 | 18.14 |
| 44926.71875 | 18.04 |
| 44926.729166666664 | 18.36 |
| 44926.739583333336 | 17.23 |
| 44926.75 | 14.81 |
| 44926.760416666664 | 16.97 |
| 44926.770833333336 | 16.69 |
| 44926.78125 | 16.52 |
| 44926.791666666664 | 16.76 |
| 44926.802083333336 | 17.08 |
| 44926.8125 | 17.18 |
| 44926.822916666664 | 17.09 |
| 44926.833333333336 | 17.36 |
| 44926.84375 | 17.32 |
| 44926.854166666664 | 16.27 |
| 44926.864583333336 | 20.1 |
| 44926.875 | 17.29 |
| 44926.885416666664 | 19.9 |
| 44926.895833333336 | 14.79 |
| 44926.90625 | 17.44 |
| 44926.916666666664 | 16.85 |
| 44926.927083333336 | 17.43 |
| 44926.9375 | 17.36 |
| 44926.947916666664 | 16.98 |
| 44926.958333333336 | 16.47 |
| 44926.96875 | 17.06 |
| 44926.979166666664 | 16.76 |
| 44926.989583333336 | 16.62 |
| 44927.0 | 16.84 |
| 44927.010416666664 | 16.97 |
| 44927.020833333336 | 18.26 |
| 44927.03125 | 17.64 |
| 44927.041666666664 | 18.26 |
| 44927.052083333336 | 19.48 |
| 44927.0625 | 18.23 |
| 44927.072916666664 | 18.49 |
| 44927.083333333336 | 15.68 |
| 44927.09375 | 17.83 |
| 44927.104166666664 | 20.51 |
| 44927.114583333336 | 17.87 |
| 44927.125 | 19.55 |
| 44927.135416666664 | 18.98 |
| 44927.145833333336 | 18.95 |